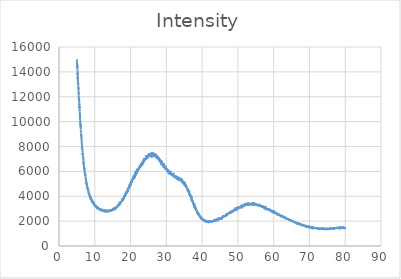
| Category | Intensity |
|---|---|
| 5.0 | 15005 |
| 5.02 | 14952 |
| 5.04 | 14813 |
| 5.06 | 14554 |
| 5.08 | 14655 |
| 5.1 | 14318 |
| 5.12 | 14511 |
| 5.14 | 14189 |
| 5.16 | 14119 |
| 5.18 | 13913 |
| 5.2 | 13795 |
| 5.22 | 13940 |
| 5.24 | 13395 |
| 5.26 | 13611 |
| 5.28 | 13391 |
| 5.3 | 13389 |
| 5.32 | 13274 |
| 5.34 | 13050 |
| 5.36 | 13098 |
| 5.38 | 12923 |
| 5.4 | 12875 |
| 5.42 | 12619 |
| 5.44 | 12752 |
| 5.46 | 12563 |
| 5.48 | 12265 |
| 5.5 | 12319 |
| 5.52 | 12090 |
| 5.54 | 11977 |
| 5.56 | 11777 |
| 5.58 | 11646 |
| 5.6 | 11707 |
| 5.62 | 11916 |
| 5.64 | 11529 |
| 5.66 | 11331 |
| 5.68 | 11416 |
| 5.7 | 11079 |
| 5.72 | 11252 |
| 5.74 | 11083 |
| 5.76 | 10881 |
| 5.78 | 10916 |
| 5.8 | 10822 |
| 5.82 | 10483 |
| 5.84 | 10357 |
| 5.86 | 10312 |
| 5.88 | 10627 |
| 5.9 | 10221 |
| 5.92 | 9997 |
| 5.94 | 10034 |
| 5.96 | 9799 |
| 5.98 | 9768 |
| 6.0 | 9729 |
| 6.02 | 9867 |
| 6.04 | 9549 |
| 6.06 | 9697 |
| 6.08 | 9339 |
| 6.1 | 9264 |
| 6.12 | 9253 |
| 6.14 | 9113 |
| 6.16 | 9078 |
| 6.18 | 9033 |
| 6.2 | 8795 |
| 6.22 | 8984 |
| 6.24 | 8837 |
| 6.26 | 8747 |
| 6.28 | 8669 |
| 6.3 | 8688 |
| 6.32 | 8534 |
| 6.34 | 8543 |
| 6.36 | 8202 |
| 6.38 | 8177 |
| 6.4 | 8191 |
| 6.42 | 8208 |
| 6.44 | 8095 |
| 6.46 | 7788 |
| 6.48 | 7885 |
| 6.5 | 7824 |
| 6.52 | 7776 |
| 6.54 | 7689 |
| 6.56 | 7533 |
| 6.58 | 7528 |
| 6.6 | 7382 |
| 6.62 | 7327 |
| 6.64 | 7465 |
| 6.66 | 7439 |
| 6.68 | 7256 |
| 6.7 | 7175 |
| 6.72 | 7070 |
| 6.74 | 7187 |
| 6.76 | 7092 |
| 6.78 | 6926 |
| 6.8 | 6913 |
| 6.82 | 6947 |
| 6.84 | 6867 |
| 6.86 | 6611 |
| 6.88 | 6691 |
| 6.9 | 6750 |
| 6.92 | 6604 |
| 6.94 | 6467 |
| 6.96 | 6521 |
| 6.98 | 6542 |
| 7.0 | 6319 |
| 7.02 | 6363 |
| 7.04 | 6125 |
| 7.06 | 6295 |
| 7.08 | 6133 |
| 7.1 | 6136 |
| 7.12 | 6195 |
| 7.14 | 6014 |
| 7.16 | 5944 |
| 7.18 | 5918 |
| 7.2 | 5945 |
| 7.22 | 5826 |
| 7.24 | 5897 |
| 7.26 | 5782 |
| 7.28 | 5836 |
| 7.3 | 5774 |
| 7.32 | 5650 |
| 7.34 | 5632 |
| 7.36 | 5779 |
| 7.38 | 5620 |
| 7.4 | 5590 |
| 7.42 | 5469 |
| 7.44 | 5490 |
| 7.46 | 5500 |
| 7.48 | 5498 |
| 7.5 | 5333 |
| 7.52 | 5283 |
| 7.54 | 5147 |
| 7.56 | 5350 |
| 7.58 | 5272 |
| 7.6 | 5282 |
| 7.62 | 5114 |
| 7.64 | 5043 |
| 7.66 | 4933 |
| 7.68 | 4928 |
| 7.7 | 5122 |
| 7.72 | 4981 |
| 7.74 | 4982 |
| 7.76 | 4981 |
| 7.78 | 4934 |
| 7.8 | 4964 |
| 7.82 | 4791 |
| 7.84 | 4927 |
| 7.86 | 4872 |
| 7.88 | 4821 |
| 7.9 | 4759 |
| 7.92 | 4650 |
| 7.94 | 4760 |
| 7.96 | 4732 |
| 7.98 | 4593 |
| 8.0 | 4634 |
| 8.02 | 4582 |
| 8.04 | 4531 |
| 8.06 | 4525 |
| 8.08 | 4460 |
| 8.1 | 4495 |
| 8.12 | 4495 |
| 8.14 | 4513 |
| 8.16 | 4489 |
| 8.18 | 4535 |
| 8.2 | 4381 |
| 8.22 | 4392 |
| 8.24 | 4432 |
| 8.26 | 4380 |
| 8.28 | 4243 |
| 8.3 | 4258 |
| 8.32 | 4305 |
| 8.34 | 4216 |
| 8.36 | 4200 |
| 8.38 | 4253 |
| 8.4 | 4243 |
| 8.42 | 4191 |
| 8.44 | 4137 |
| 8.46 | 4210 |
| 8.48 | 4148 |
| 8.5 | 4126 |
| 8.52 | 4130 |
| 8.54 | 4037 |
| 8.56 | 4120 |
| 8.58 | 4029 |
| 8.6 | 4004 |
| 8.62 | 3953 |
| 8.64 | 4037 |
| 8.66 | 4099 |
| 8.68 | 3976 |
| 8.7 | 4007 |
| 8.72 | 4014 |
| 8.74 | 3887 |
| 8.76 | 4025 |
| 8.78 | 3826 |
| 8.8 | 3931 |
| 8.82 | 3880 |
| 8.84 | 3749 |
| 8.86 | 3846 |
| 8.88 | 3784 |
| 8.9 | 3830 |
| 8.92 | 3866 |
| 8.94 | 3850 |
| 8.96 | 3809 |
| 8.98 | 3771 |
| 9.0 | 3727 |
| 9.02 | 3683 |
| 9.04 | 3726 |
| 9.06 | 3797 |
| 9.08 | 3799 |
| 9.1 | 3633 |
| 9.12 | 3620 |
| 9.14 | 3677 |
| 9.16 | 3723 |
| 9.18 | 3618 |
| 9.2 | 3640 |
| 9.22 | 3666 |
| 9.24 | 3683 |
| 9.26 | 3644 |
| 9.28 | 3572 |
| 9.3 | 3563 |
| 9.32 | 3590 |
| 9.34 | 3567 |
| 9.36 | 3630 |
| 9.38 | 3478 |
| 9.4 | 3591 |
| 9.42 | 3467 |
| 9.44 | 3605 |
| 9.46 | 3463 |
| 9.48 | 3488 |
| 9.5 | 3526 |
| 9.52 | 3507 |
| 9.54 | 3500 |
| 9.56 | 3553 |
| 9.58 | 3525 |
| 9.6 | 3400 |
| 9.62 | 3564 |
| 9.64 | 3401 |
| 9.66 | 3449 |
| 9.68 | 3368 |
| 9.7 | 3330 |
| 9.72 | 3392 |
| 9.74 | 3439 |
| 9.76 | 3298 |
| 9.78 | 3265 |
| 9.8 | 3286 |
| 9.82 | 3393 |
| 9.84 | 3391 |
| 9.86 | 3398 |
| 9.88 | 3376 |
| 9.9 | 3294 |
| 9.92 | 3319 |
| 9.94 | 3351 |
| 9.96 | 3307 |
| 9.98 | 3268 |
| 10.0 | 3306 |
| 10.02 | 3192 |
| 10.04 | 3223 |
| 10.06 | 3244 |
| 10.08 | 3307 |
| 10.1 | 3338 |
| 10.12 | 3292 |
| 10.14 | 3194 |
| 10.16 | 3279 |
| 10.18 | 3222 |
| 10.2 | 3266 |
| 10.22 | 3200 |
| 10.24 | 3264 |
| 10.26 | 3226 |
| 10.28 | 3170 |
| 10.3 | 3203 |
| 10.32 | 3115 |
| 10.34 | 3235 |
| 10.36 | 3173 |
| 10.38 | 3147 |
| 10.4 | 3139 |
| 10.42 | 3178 |
| 10.44 | 3141 |
| 10.46 | 3110 |
| 10.48 | 3142 |
| 10.5 | 3221 |
| 10.52 | 3057 |
| 10.54 | 3177 |
| 10.56 | 3127 |
| 10.58 | 3022 |
| 10.6 | 3130 |
| 10.62 | 3108 |
| 10.64 | 3072 |
| 10.66 | 3059 |
| 10.68 | 2986 |
| 10.7 | 2994 |
| 10.72 | 3159 |
| 10.74 | 3131 |
| 10.76 | 2957 |
| 10.78 | 3005 |
| 10.8 | 3091 |
| 10.82 | 3064 |
| 10.84 | 3102 |
| 10.86 | 3030 |
| 10.88 | 3116 |
| 10.9 | 3106 |
| 10.92 | 3037 |
| 10.94 | 3160 |
| 10.96 | 3056 |
| 10.98 | 3007 |
| 11.0 | 3039 |
| 11.02 | 3040 |
| 11.04 | 3065 |
| 11.06 | 2977 |
| 11.08 | 3007 |
| 11.1 | 2989 |
| 11.12 | 2917 |
| 11.14 | 3049 |
| 11.16 | 2974 |
| 11.18 | 3051 |
| 11.2 | 2955 |
| 11.22 | 2919 |
| 11.24 | 2961 |
| 11.26 | 3002 |
| 11.28 | 3062 |
| 11.3 | 2922 |
| 11.32 | 2943 |
| 11.34 | 2987 |
| 11.36 | 2935 |
| 11.38 | 2959 |
| 11.4 | 2971 |
| 11.42 | 2927 |
| 11.44 | 2893 |
| 11.46 | 2992 |
| 11.48 | 2901 |
| 11.5 | 2879 |
| 11.52 | 2926 |
| 11.54 | 2922 |
| 11.56 | 2857 |
| 11.58 | 2886 |
| 11.6 | 2835 |
| 11.62 | 3018 |
| 11.64 | 2987 |
| 11.66 | 2900 |
| 11.68 | 2903 |
| 11.7 | 2888 |
| 11.72 | 2956 |
| 11.74 | 2911 |
| 11.76 | 2855 |
| 11.78 | 2921 |
| 11.8 | 2907 |
| 11.82 | 2855 |
| 11.84 | 2862 |
| 11.86 | 2912 |
| 11.88 | 2846 |
| 11.9 | 2895 |
| 11.92 | 2977 |
| 11.94 | 2912 |
| 11.96 | 2991 |
| 11.98 | 2940 |
| 12.0 | 2816 |
| 12.02 | 2938 |
| 12.04 | 2821 |
| 12.06 | 2945 |
| 12.08 | 2778 |
| 12.1 | 2840 |
| 12.12 | 2905 |
| 12.14 | 2867 |
| 12.16 | 2815 |
| 12.18 | 2943 |
| 12.2 | 2845 |
| 12.22 | 2806 |
| 12.24 | 2890 |
| 12.26 | 2907 |
| 12.28 | 2825 |
| 12.3 | 2848 |
| 12.32 | 2858 |
| 12.34 | 2838 |
| 12.36 | 2878 |
| 12.38 | 2892 |
| 12.4 | 2817 |
| 12.42 | 2776 |
| 12.44 | 2868 |
| 12.46 | 2879 |
| 12.48 | 2815 |
| 12.5 | 2807 |
| 12.52 | 2861 |
| 12.54 | 2752 |
| 12.56 | 2867 |
| 12.58 | 2871 |
| 12.6 | 2867 |
| 12.62 | 2816 |
| 12.64 | 2769 |
| 12.66 | 2845 |
| 12.68 | 2858 |
| 12.7 | 2851 |
| 12.72 | 2828 |
| 12.74 | 2774 |
| 12.76 | 2767 |
| 12.78 | 2787 |
| 12.8 | 2870 |
| 12.82 | 2817 |
| 12.84 | 2866 |
| 12.86 | 2821 |
| 12.88 | 2785 |
| 12.9 | 2797 |
| 12.92 | 2809 |
| 12.94 | 2932 |
| 12.96 | 2864 |
| 12.98 | 2782 |
| 13.0 | 2784 |
| 13.02 | 2863 |
| 13.04 | 2784 |
| 13.06 | 2772 |
| 13.08 | 2849 |
| 13.1 | 2822 |
| 13.12 | 2768 |
| 13.14 | 2790 |
| 13.16 | 2838 |
| 13.18 | 2828 |
| 13.2 | 2793 |
| 13.22 | 2846 |
| 13.24 | 2851 |
| 13.26 | 2842 |
| 13.28 | 2831 |
| 13.3 | 2761 |
| 13.32 | 2790 |
| 13.34 | 2732 |
| 13.36 | 2716 |
| 13.38 | 2836 |
| 13.4 | 2746 |
| 13.42 | 2758 |
| 13.44 | 2719 |
| 13.46 | 2776 |
| 13.48 | 2868 |
| 13.5 | 2776 |
| 13.52 | 2778 |
| 13.54 | 2772 |
| 13.56 | 2816 |
| 13.58 | 2697 |
| 13.6 | 2916 |
| 13.62 | 2804 |
| 13.64 | 2748 |
| 13.66 | 2789 |
| 13.68 | 2783 |
| 13.7 | 2729 |
| 13.72 | 2816 |
| 13.74 | 2787 |
| 13.76 | 2797 |
| 13.78 | 2765 |
| 13.8 | 2752 |
| 13.82 | 2824 |
| 13.84 | 2772 |
| 13.86 | 2836 |
| 13.88 | 2888 |
| 13.9 | 2817 |
| 13.92 | 2807 |
| 13.94 | 2730 |
| 13.96 | 2843 |
| 13.98 | 2842 |
| 14.0 | 2750 |
| 14.02 | 2908 |
| 14.04 | 2834 |
| 14.06 | 2922 |
| 14.08 | 2801 |
| 14.1 | 2849 |
| 14.12 | 2762 |
| 14.14 | 2745 |
| 14.16 | 2892 |
| 14.18 | 2851 |
| 14.2 | 2813 |
| 14.22 | 2810 |
| 14.24 | 2768 |
| 14.26 | 2867 |
| 14.28 | 2849 |
| 14.3 | 2823 |
| 14.32 | 2849 |
| 14.34 | 2752 |
| 14.36 | 2813 |
| 14.38 | 2830 |
| 14.4 | 2815 |
| 14.42 | 2770 |
| 14.44 | 2818 |
| 14.46 | 2910 |
| 14.48 | 2867 |
| 14.5 | 2916 |
| 14.52 | 2968 |
| 14.54 | 2917 |
| 14.56 | 2869 |
| 14.58 | 2874 |
| 14.6 | 2807 |
| 14.62 | 2911 |
| 14.64 | 2914 |
| 14.66 | 2821 |
| 14.68 | 2912 |
| 14.7 | 2899 |
| 14.72 | 2803 |
| 14.74 | 2867 |
| 14.76 | 2921 |
| 14.78 | 2846 |
| 14.8 | 2836 |
| 14.82 | 2894 |
| 14.84 | 2910 |
| 14.86 | 2848 |
| 14.88 | 2887 |
| 14.9 | 2853 |
| 14.92 | 2815 |
| 14.94 | 2930 |
| 14.96 | 2981 |
| 14.98 | 2900 |
| 15.0 | 2943 |
| 15.02 | 2915 |
| 15.04 | 2955 |
| 15.06 | 2919 |
| 15.08 | 2926 |
| 15.1 | 2953 |
| 15.12 | 2948 |
| 15.14 | 3020 |
| 15.16 | 3043 |
| 15.18 | 2917 |
| 15.2 | 2954 |
| 15.22 | 3054 |
| 15.24 | 2989 |
| 15.26 | 2951 |
| 15.28 | 3027 |
| 15.3 | 3094 |
| 15.32 | 2910 |
| 15.34 | 2960 |
| 15.36 | 3005 |
| 15.38 | 3007 |
| 15.4 | 2940 |
| 15.42 | 3015 |
| 15.44 | 3015 |
| 15.46 | 2924 |
| 15.48 | 2950 |
| 15.5 | 3022 |
| 15.52 | 2946 |
| 15.54 | 2864 |
| 15.56 | 2984 |
| 15.58 | 3057 |
| 15.6 | 3014 |
| 15.62 | 3038 |
| 15.64 | 3068 |
| 15.66 | 3077 |
| 15.68 | 2994 |
| 15.7 | 2995 |
| 15.72 | 2962 |
| 15.74 | 3041 |
| 15.76 | 3113 |
| 15.78 | 3017 |
| 15.8 | 3031 |
| 15.82 | 3005 |
| 15.84 | 3026 |
| 15.86 | 3160 |
| 15.88 | 3003 |
| 15.9 | 3083 |
| 15.92 | 3067 |
| 15.94 | 3116 |
| 15.96 | 3104 |
| 15.98 | 3146 |
| 16.0 | 3109 |
| 16.02 | 3091 |
| 16.04 | 3057 |
| 16.06 | 3067 |
| 16.08 | 3182 |
| 16.1 | 3120 |
| 16.12 | 3109 |
| 16.14 | 3154 |
| 16.16 | 3131 |
| 16.18 | 3150 |
| 16.2 | 3121 |
| 16.22 | 3143 |
| 16.24 | 3159 |
| 16.26 | 3160 |
| 16.28 | 3180 |
| 16.3 | 3132 |
| 16.32 | 3155 |
| 16.34 | 3178 |
| 16.36 | 3244 |
| 16.38 | 3220 |
| 16.4 | 3150 |
| 16.42 | 3179 |
| 16.44 | 3210 |
| 16.46 | 3238 |
| 16.48 | 3256 |
| 16.5 | 3236 |
| 16.52 | 3171 |
| 16.54 | 3243 |
| 16.56 | 3315 |
| 16.58 | 3249 |
| 16.6 | 3255 |
| 16.62 | 3254 |
| 16.64 | 3338 |
| 16.66 | 3319 |
| 16.68 | 3254 |
| 16.7 | 3394 |
| 16.72 | 3266 |
| 16.74 | 3340 |
| 16.76 | 3312 |
| 16.78 | 3406 |
| 16.8 | 3376 |
| 16.82 | 3330 |
| 16.84 | 3351 |
| 16.86 | 3337 |
| 16.88 | 3343 |
| 16.9 | 3323 |
| 16.92 | 3362 |
| 16.94 | 3289 |
| 16.96 | 3565 |
| 16.98 | 3407 |
| 17.0 | 3434 |
| 17.02 | 3402 |
| 17.04 | 3366 |
| 17.06 | 3391 |
| 17.08 | 3425 |
| 17.1 | 3408 |
| 17.12 | 3418 |
| 17.14 | 3461 |
| 17.16 | 3503 |
| 17.18 | 3462 |
| 17.2 | 3484 |
| 17.22 | 3569 |
| 17.24 | 3447 |
| 17.26 | 3483 |
| 17.28 | 3587 |
| 17.3 | 3502 |
| 17.32 | 3537 |
| 17.34 | 3505 |
| 17.36 | 3495 |
| 17.38 | 3557 |
| 17.4 | 3574 |
| 17.42 | 3615 |
| 17.44 | 3570 |
| 17.46 | 3572 |
| 17.48 | 3542 |
| 17.5 | 3602 |
| 17.52 | 3545 |
| 17.54 | 3600 |
| 17.56 | 3582 |
| 17.58 | 3670 |
| 17.6 | 3680 |
| 17.62 | 3659 |
| 17.64 | 3639 |
| 17.66 | 3827 |
| 17.68 | 3702 |
| 17.7 | 3720 |
| 17.72 | 3648 |
| 17.74 | 3780 |
| 17.76 | 3691 |
| 17.78 | 3753 |
| 17.8 | 3710 |
| 17.82 | 3733 |
| 17.84 | 3835 |
| 17.86 | 3743 |
| 17.88 | 3662 |
| 17.9 | 3785 |
| 17.92 | 3717 |
| 17.94 | 3824 |
| 17.96 | 3825 |
| 17.98 | 3789 |
| 18.0 | 3765 |
| 18.02 | 3876 |
| 18.04 | 3736 |
| 18.06 | 3883 |
| 18.08 | 3857 |
| 18.1 | 3890 |
| 18.12 | 3829 |
| 18.14 | 3802 |
| 18.16 | 3865 |
| 18.18 | 3909 |
| 18.2 | 3961 |
| 18.22 | 3868 |
| 18.24 | 3921 |
| 18.26 | 3982 |
| 18.28 | 4046 |
| 18.3 | 4091 |
| 18.32 | 3956 |
| 18.34 | 4059 |
| 18.36 | 3963 |
| 18.38 | 3973 |
| 18.4 | 4097 |
| 18.42 | 4015 |
| 18.44 | 4057 |
| 18.46 | 4036 |
| 18.48 | 4068 |
| 18.5 | 4126 |
| 18.52 | 4054 |
| 18.54 | 4105 |
| 18.56 | 4232 |
| 18.58 | 4150 |
| 18.6 | 4146 |
| 18.62 | 4130 |
| 18.64 | 4216 |
| 18.66 | 4259 |
| 18.68 | 4117 |
| 18.7 | 4236 |
| 18.72 | 4231 |
| 18.74 | 4110 |
| 18.76 | 4334 |
| 18.78 | 4324 |
| 18.8 | 4317 |
| 18.82 | 4354 |
| 18.84 | 4188 |
| 18.86 | 4174 |
| 18.88 | 4391 |
| 18.9 | 4276 |
| 18.92 | 4268 |
| 18.94 | 4402 |
| 18.96 | 4407 |
| 18.98 | 4353 |
| 19.0 | 4410 |
| 19.02 | 4399 |
| 19.04 | 4365 |
| 19.06 | 4400 |
| 19.08 | 4404 |
| 19.1 | 4284 |
| 19.12 | 4403 |
| 19.14 | 4501 |
| 19.16 | 4455 |
| 19.18 | 4594 |
| 19.2 | 4591 |
| 19.22 | 4560 |
| 19.24 | 4561 |
| 19.26 | 4538 |
| 19.28 | 4369 |
| 19.3 | 4547 |
| 19.32 | 4515 |
| 19.34 | 4529 |
| 19.36 | 4535 |
| 19.38 | 4680 |
| 19.4 | 4584 |
| 19.42 | 4653 |
| 19.44 | 4620 |
| 19.46 | 4650 |
| 19.48 | 4736 |
| 19.5 | 4571 |
| 19.52 | 4727 |
| 19.54 | 4714 |
| 19.56 | 4684 |
| 19.58 | 4810 |
| 19.6 | 4812 |
| 19.62 | 4651 |
| 19.64 | 4718 |
| 19.66 | 4918 |
| 19.68 | 4760 |
| 19.7 | 4837 |
| 19.72 | 4784 |
| 19.74 | 4725 |
| 19.76 | 4769 |
| 19.78 | 4850 |
| 19.8 | 4881 |
| 19.82 | 4829 |
| 19.84 | 5004 |
| 19.86 | 4866 |
| 19.88 | 4870 |
| 19.9 | 4861 |
| 19.92 | 4986 |
| 19.94 | 5014 |
| 19.96 | 5042 |
| 19.98 | 5009 |
| 20.0 | 5028 |
| 20.02 | 4859 |
| 20.04 | 5040 |
| 20.06 | 4958 |
| 20.08 | 5093 |
| 20.1 | 5034 |
| 20.12 | 5141 |
| 20.14 | 5063 |
| 20.16 | 5165 |
| 20.18 | 5073 |
| 20.2 | 5105 |
| 20.22 | 5114 |
| 20.24 | 5227 |
| 20.26 | 5201 |
| 20.28 | 5203 |
| 20.3 | 5225 |
| 20.32 | 5080 |
| 20.34 | 5138 |
| 20.36 | 5273 |
| 20.38 | 5204 |
| 20.4 | 5328 |
| 20.42 | 5095 |
| 20.44 | 5388 |
| 20.46 | 5264 |
| 20.48 | 5270 |
| 20.5 | 5297 |
| 20.52 | 5349 |
| 20.54 | 5344 |
| 20.56 | 5380 |
| 20.58 | 5318 |
| 20.6 | 5303 |
| 20.62 | 5399 |
| 20.64 | 5358 |
| 20.66 | 5463 |
| 20.68 | 5371 |
| 20.7 | 5502 |
| 20.72 | 5407 |
| 20.74 | 5326 |
| 20.76 | 5385 |
| 20.78 | 5510 |
| 20.8 | 5454 |
| 20.82 | 5583 |
| 20.84 | 5521 |
| 20.86 | 5574 |
| 20.88 | 5383 |
| 20.9 | 5456 |
| 20.92 | 5667 |
| 20.94 | 5563 |
| 20.96 | 5441 |
| 20.98 | 5507 |
| 21.0 | 5422 |
| 21.02 | 5623 |
| 21.04 | 5594 |
| 21.06 | 5691 |
| 21.08 | 5664 |
| 21.1 | 5678 |
| 21.12 | 5647 |
| 21.14 | 5718 |
| 21.16 | 5739 |
| 21.18 | 5673 |
| 21.2 | 5642 |
| 21.22 | 5508 |
| 21.24 | 5689 |
| 21.26 | 5758 |
| 21.28 | 5733 |
| 21.3 | 5709 |
| 21.32 | 5917 |
| 21.34 | 5806 |
| 21.36 | 5652 |
| 21.38 | 5986 |
| 21.4 | 5754 |
| 21.42 | 5786 |
| 21.44 | 5807 |
| 21.46 | 5824 |
| 21.48 | 5900 |
| 21.5 | 5841 |
| 21.52 | 5850 |
| 21.54 | 5980 |
| 21.56 | 5807 |
| 21.58 | 5852 |
| 21.6 | 5808 |
| 21.62 | 5951 |
| 21.64 | 5893 |
| 21.66 | 5802 |
| 21.68 | 6134 |
| 21.7 | 6062 |
| 21.72 | 5893 |
| 21.74 | 5910 |
| 21.76 | 5901 |
| 21.78 | 6030 |
| 21.8 | 5960 |
| 21.82 | 6142 |
| 21.84 | 5954 |
| 21.86 | 6038 |
| 21.88 | 6026 |
| 21.9 | 6113 |
| 21.92 | 6020 |
| 21.94 | 6157 |
| 21.96 | 6095 |
| 21.98 | 6197 |
| 22.0 | 6244 |
| 22.02 | 5990 |
| 22.04 | 6092 |
| 22.06 | 5999 |
| 22.08 | 6110 |
| 22.1 | 6094 |
| 22.12 | 6068 |
| 22.14 | 6112 |
| 22.16 | 6214 |
| 22.18 | 6154 |
| 22.2 | 6154 |
| 22.22 | 6247 |
| 22.24 | 6281 |
| 22.26 | 6130 |
| 22.28 | 6235 |
| 22.3 | 6207 |
| 22.32 | 6238 |
| 22.34 | 6278 |
| 22.36 | 6297 |
| 22.38 | 6319 |
| 22.4 | 6231 |
| 22.42 | 6294 |
| 22.44 | 6256 |
| 22.46 | 6263 |
| 22.48 | 6357 |
| 22.5 | 6339 |
| 22.52 | 6360 |
| 22.54 | 6350 |
| 22.56 | 6387 |
| 22.58 | 6486 |
| 22.6 | 6351 |
| 22.62 | 6482 |
| 22.64 | 6263 |
| 22.66 | 6464 |
| 22.68 | 6433 |
| 22.7 | 6427 |
| 22.72 | 6507 |
| 22.74 | 6379 |
| 22.76 | 6508 |
| 22.78 | 6441 |
| 22.8 | 6500 |
| 22.82 | 6401 |
| 22.84 | 6543 |
| 22.86 | 6413 |
| 22.88 | 6536 |
| 22.9 | 6342 |
| 22.92 | 6589 |
| 22.94 | 6608 |
| 22.96 | 6540 |
| 22.98 | 6595 |
| 23.0 | 6485 |
| 23.02 | 6489 |
| 23.04 | 6441 |
| 23.06 | 6654 |
| 23.08 | 6565 |
| 23.1 | 6613 |
| 23.12 | 6568 |
| 23.14 | 6682 |
| 23.16 | 6563 |
| 23.18 | 6486 |
| 23.2 | 6677 |
| 23.22 | 6690 |
| 23.24 | 6499 |
| 23.26 | 6690 |
| 23.28 | 6723 |
| 23.3 | 6506 |
| 23.32 | 6682 |
| 23.34 | 6766 |
| 23.36 | 6673 |
| 23.38 | 6766 |
| 23.4 | 6831 |
| 23.42 | 6756 |
| 23.44 | 6709 |
| 23.46 | 6706 |
| 23.48 | 6763 |
| 23.5 | 6758 |
| 23.52 | 6785 |
| 23.54 | 6819 |
| 23.56 | 6624 |
| 23.58 | 6942 |
| 23.6 | 6861 |
| 23.62 | 6795 |
| 23.64 | 6750 |
| 23.66 | 6877 |
| 23.68 | 6872 |
| 23.7 | 6912 |
| 23.72 | 6844 |
| 23.74 | 6926 |
| 23.76 | 7009 |
| 23.78 | 6775 |
| 23.8 | 6890 |
| 23.82 | 6851 |
| 23.84 | 7034 |
| 23.86 | 6864 |
| 23.88 | 7078 |
| 23.9 | 6918 |
| 23.92 | 6918 |
| 23.94 | 6960 |
| 23.96 | 6942 |
| 23.98 | 6929 |
| 24.0 | 7002 |
| 24.02 | 7040 |
| 24.04 | 6885 |
| 24.06 | 6918 |
| 24.08 | 6937 |
| 24.1 | 7045 |
| 24.12 | 6932 |
| 24.14 | 6895 |
| 24.16 | 7074 |
| 24.18 | 7027 |
| 24.2 | 7015 |
| 24.22 | 7028 |
| 24.24 | 7089 |
| 24.26 | 7068 |
| 24.28 | 7012 |
| 24.3 | 7134 |
| 24.32 | 7060 |
| 24.34 | 6939 |
| 24.36 | 7065 |
| 24.38 | 7082 |
| 24.4 | 7186 |
| 24.42 | 7162 |
| 24.44 | 7059 |
| 24.46 | 7105 |
| 24.48 | 7316 |
| 24.5 | 7074 |
| 24.52 | 7128 |
| 24.54 | 7261 |
| 24.56 | 7176 |
| 24.58 | 7071 |
| 24.6 | 7016 |
| 24.62 | 7029 |
| 24.64 | 7227 |
| 24.66 | 7060 |
| 24.68 | 7290 |
| 24.7 | 7307 |
| 24.72 | 7030 |
| 24.74 | 7113 |
| 24.76 | 7221 |
| 24.78 | 7136 |
| 24.8 | 7292 |
| 24.82 | 7326 |
| 24.84 | 7194 |
| 24.86 | 7248 |
| 24.88 | 7245 |
| 24.9 | 7195 |
| 24.92 | 7303 |
| 24.94 | 7240 |
| 24.96 | 7233 |
| 24.98 | 7197 |
| 25.0 | 7186 |
| 25.02 | 7185 |
| 25.04 | 7271 |
| 25.06 | 7376 |
| 25.08 | 7368 |
| 25.1 | 7255 |
| 25.12 | 7291 |
| 25.14 | 7427 |
| 25.16 | 7313 |
| 25.18 | 7358 |
| 25.2 | 7453 |
| 25.22 | 7329 |
| 25.24 | 7409 |
| 25.26 | 7296 |
| 25.28 | 7391 |
| 25.3 | 7219 |
| 25.32 | 7234 |
| 25.34 | 7159 |
| 25.36 | 7343 |
| 25.38 | 7455 |
| 25.4 | 7441 |
| 25.42 | 7315 |
| 25.44 | 7377 |
| 25.46 | 7343 |
| 25.48 | 7297 |
| 25.5 | 7446 |
| 25.52 | 7371 |
| 25.54 | 7405 |
| 25.56 | 7328 |
| 25.58 | 7387 |
| 25.6 | 7400 |
| 25.62 | 7321 |
| 25.64 | 7340 |
| 25.66 | 7349 |
| 25.68 | 7224 |
| 25.7 | 7418 |
| 25.72 | 7477 |
| 25.74 | 7271 |
| 25.76 | 7240 |
| 25.78 | 7350 |
| 25.8 | 7260 |
| 25.82 | 7327 |
| 25.84 | 7112 |
| 25.86 | 7410 |
| 25.88 | 7264 |
| 25.9 | 7555 |
| 25.92 | 7493 |
| 25.94 | 7292 |
| 25.96 | 7347 |
| 25.98 | 7414 |
| 26.0 | 7313 |
| 26.02 | 7350 |
| 26.04 | 7397 |
| 26.06 | 7360 |
| 26.08 | 7250 |
| 26.1 | 7179 |
| 26.12 | 7370 |
| 26.14 | 7415 |
| 26.16 | 7128 |
| 26.18 | 7327 |
| 26.2 | 7357 |
| 26.22 | 7328 |
| 26.24 | 7447 |
| 26.26 | 7485 |
| 26.28 | 7281 |
| 26.3 | 7509 |
| 26.32 | 7207 |
| 26.34 | 7290 |
| 26.36 | 7404 |
| 26.38 | 7363 |
| 26.4 | 7253 |
| 26.42 | 7335 |
| 26.44 | 7267 |
| 26.46 | 7349 |
| 26.48 | 7299 |
| 26.5 | 7456 |
| 26.52 | 7464 |
| 26.54 | 7344 |
| 26.56 | 7426 |
| 26.58 | 7409 |
| 26.6 | 7218 |
| 26.62 | 7388 |
| 26.64 | 7261 |
| 26.66 | 7411 |
| 26.68 | 7303 |
| 26.7 | 7307 |
| 26.72 | 7397 |
| 26.74 | 7306 |
| 26.76 | 7181 |
| 26.78 | 7332 |
| 26.8 | 7281 |
| 26.82 | 7315 |
| 26.84 | 7298 |
| 26.86 | 7282 |
| 26.88 | 7156 |
| 26.9 | 7258 |
| 26.92 | 7315 |
| 26.94 | 7203 |
| 26.96 | 7245 |
| 26.98 | 7198 |
| 27.0 | 7417 |
| 27.02 | 7266 |
| 27.04 | 7347 |
| 27.06 | 7248 |
| 27.08 | 7274 |
| 27.1 | 7352 |
| 27.12 | 7155 |
| 27.14 | 7281 |
| 27.16 | 7181 |
| 27.18 | 7198 |
| 27.2 | 7076 |
| 27.22 | 7243 |
| 27.24 | 7099 |
| 27.26 | 7055 |
| 27.28 | 7100 |
| 27.3 | 7306 |
| 27.32 | 7236 |
| 27.34 | 7117 |
| 27.36 | 7287 |
| 27.38 | 7029 |
| 27.4 | 7032 |
| 27.42 | 7138 |
| 27.44 | 7142 |
| 27.46 | 7122 |
| 27.48 | 7031 |
| 27.5 | 7096 |
| 27.52 | 7117 |
| 27.54 | 7129 |
| 27.56 | 7094 |
| 27.58 | 7194 |
| 27.6 | 7177 |
| 27.62 | 7111 |
| 27.64 | 7078 |
| 27.66 | 7159 |
| 27.68 | 7042 |
| 27.7 | 7021 |
| 27.72 | 7116 |
| 27.74 | 6971 |
| 27.76 | 6984 |
| 27.78 | 7114 |
| 27.8 | 6961 |
| 27.82 | 7093 |
| 27.84 | 6979 |
| 27.86 | 7133 |
| 27.88 | 7017 |
| 27.9 | 6883 |
| 27.92 | 6980 |
| 27.94 | 6976 |
| 27.96 | 6882 |
| 27.98 | 6889 |
| 28.0 | 6919 |
| 28.02 | 6993 |
| 28.04 | 6837 |
| 28.06 | 6907 |
| 28.08 | 6934 |
| 28.1 | 6891 |
| 28.12 | 6892 |
| 28.14 | 7026 |
| 28.16 | 6841 |
| 28.18 | 6879 |
| 28.2 | 6946 |
| 28.22 | 6830 |
| 28.24 | 6863 |
| 28.26 | 6848 |
| 28.28 | 6835 |
| 28.3 | 6722 |
| 28.32 | 6801 |
| 28.34 | 6822 |
| 28.36 | 6738 |
| 28.38 | 6816 |
| 28.4 | 6710 |
| 28.42 | 6749 |
| 28.44 | 6821 |
| 28.46 | 6738 |
| 28.48 | 6727 |
| 28.5 | 6771 |
| 28.52 | 6648 |
| 28.54 | 6891 |
| 28.56 | 6888 |
| 28.58 | 6644 |
| 28.6 | 6713 |
| 28.62 | 6831 |
| 28.64 | 6501 |
| 28.66 | 6724 |
| 28.68 | 6774 |
| 28.7 | 6643 |
| 28.72 | 6706 |
| 28.74 | 6808 |
| 28.76 | 6573 |
| 28.78 | 6559 |
| 28.8 | 6736 |
| 28.82 | 6659 |
| 28.84 | 6640 |
| 28.86 | 6605 |
| 28.88 | 6666 |
| 28.9 | 6512 |
| 28.92 | 6529 |
| 28.94 | 6523 |
| 28.96 | 6613 |
| 28.98 | 6470 |
| 29.0 | 6554 |
| 29.02 | 6498 |
| 29.04 | 6438 |
| 29.06 | 6494 |
| 29.08 | 6661 |
| 29.1 | 6524 |
| 29.12 | 6447 |
| 29.14 | 6432 |
| 29.16 | 6394 |
| 29.18 | 6310 |
| 29.2 | 6577 |
| 29.22 | 6597 |
| 29.24 | 6544 |
| 29.26 | 6395 |
| 29.28 | 6447 |
| 29.3 | 6381 |
| 29.32 | 6635 |
| 29.34 | 6505 |
| 29.36 | 6527 |
| 29.38 | 6359 |
| 29.4 | 6430 |
| 29.42 | 6519 |
| 29.44 | 6383 |
| 29.46 | 6448 |
| 29.48 | 6422 |
| 29.5 | 6410 |
| 29.52 | 6393 |
| 29.54 | 6287 |
| 29.56 | 6364 |
| 29.58 | 6274 |
| 29.6 | 6401 |
| 29.62 | 6332 |
| 29.64 | 6224 |
| 29.66 | 6255 |
| 29.68 | 6390 |
| 29.7 | 6206 |
| 29.72 | 6336 |
| 29.74 | 6317 |
| 29.76 | 6138 |
| 29.78 | 6277 |
| 29.8 | 6241 |
| 29.82 | 6388 |
| 29.84 | 6236 |
| 29.86 | 6167 |
| 29.88 | 6259 |
| 29.9 | 6319 |
| 29.92 | 6235 |
| 29.94 | 6228 |
| 29.96 | 6218 |
| 29.98 | 6266 |
| 30.0 | 6175 |
| 30.02 | 6159 |
| 30.04 | 6145 |
| 30.06 | 6151 |
| 30.08 | 6207 |
| 30.1 | 6219 |
| 30.12 | 6126 |
| 30.14 | 6222 |
| 30.16 | 6152 |
| 30.18 | 6142 |
| 30.2 | 6040 |
| 30.22 | 6159 |
| 30.24 | 6012 |
| 30.26 | 6041 |
| 30.28 | 6126 |
| 30.3 | 6088 |
| 30.32 | 6193 |
| 30.34 | 6047 |
| 30.36 | 5942 |
| 30.38 | 6093 |
| 30.4 | 5934 |
| 30.42 | 6122 |
| 30.44 | 6073 |
| 30.46 | 6011 |
| 30.48 | 5960 |
| 30.5 | 6053 |
| 30.52 | 6043 |
| 30.54 | 5940 |
| 30.56 | 6017 |
| 30.58 | 6040 |
| 30.6 | 5982 |
| 30.62 | 6109 |
| 30.64 | 6058 |
| 30.66 | 6046 |
| 30.68 | 6066 |
| 30.7 | 5790 |
| 30.72 | 6033 |
| 30.74 | 5881 |
| 30.76 | 5972 |
| 30.78 | 5894 |
| 30.8 | 5929 |
| 30.82 | 5951 |
| 30.84 | 5995 |
| 30.86 | 5967 |
| 30.88 | 5747 |
| 30.9 | 5944 |
| 30.92 | 5879 |
| 30.94 | 5875 |
| 30.96 | 5844 |
| 30.98 | 5993 |
| 31.0 | 5865 |
| 31.02 | 5956 |
| 31.04 | 6049 |
| 31.06 | 5800 |
| 31.08 | 5945 |
| 31.1 | 5889 |
| 31.12 | 5885 |
| 31.14 | 5729 |
| 31.16 | 5910 |
| 31.18 | 5761 |
| 31.2 | 5865 |
| 31.22 | 5893 |
| 31.24 | 5726 |
| 31.26 | 6002 |
| 31.28 | 5900 |
| 31.3 | 5771 |
| 31.32 | 5740 |
| 31.34 | 5848 |
| 31.36 | 5824 |
| 31.38 | 5718 |
| 31.4 | 5744 |
| 31.42 | 5722 |
| 31.44 | 5724 |
| 31.46 | 5788 |
| 31.48 | 5747 |
| 31.5 | 5729 |
| 31.52 | 5873 |
| 31.54 | 5792 |
| 31.56 | 5678 |
| 31.58 | 5762 |
| 31.6 | 5727 |
| 31.62 | 5761 |
| 31.64 | 5704 |
| 31.66 | 5686 |
| 31.68 | 5614 |
| 31.7 | 5681 |
| 31.72 | 5783 |
| 31.74 | 5696 |
| 31.76 | 5639 |
| 31.78 | 5705 |
| 31.8 | 5726 |
| 31.82 | 5697 |
| 31.84 | 5701 |
| 31.86 | 5731 |
| 31.88 | 5766 |
| 31.9 | 5687 |
| 31.92 | 5650 |
| 31.94 | 5704 |
| 31.96 | 5671 |
| 31.98 | 5880 |
| 32.0 | 5785 |
| 32.02 | 5774 |
| 32.04 | 5656 |
| 32.06 | 5598 |
| 32.08 | 5682 |
| 32.1 | 5594 |
| 32.12 | 5569 |
| 32.14 | 5576 |
| 32.16 | 5660 |
| 32.18 | 5547 |
| 32.2 | 5716 |
| 32.22 | 5516 |
| 32.24 | 5568 |
| 32.26 | 5495 |
| 32.28 | 5556 |
| 32.3 | 5617 |
| 32.32 | 5607 |
| 32.34 | 5624 |
| 32.36 | 5584 |
| 32.38 | 5694 |
| 32.4 | 5529 |
| 32.42 | 5586 |
| 32.44 | 5554 |
| 32.46 | 5469 |
| 32.48 | 5572 |
| 32.5 | 5597 |
| 32.52 | 5478 |
| 32.54 | 5675 |
| 32.56 | 5600 |
| 32.58 | 5576 |
| 32.6 | 5545 |
| 32.62 | 5562 |
| 32.64 | 5570 |
| 32.66 | 5514 |
| 32.68 | 5603 |
| 32.7 | 5484 |
| 32.72 | 5639 |
| 32.74 | 5630 |
| 32.76 | 5499 |
| 32.78 | 5418 |
| 32.8 | 5620 |
| 32.82 | 5455 |
| 32.84 | 5548 |
| 32.86 | 5528 |
| 32.88 | 5585 |
| 32.9 | 5521 |
| 32.92 | 5353 |
| 32.94 | 5455 |
| 32.96 | 5455 |
| 32.98 | 5507 |
| 33.0 | 5451 |
| 33.02 | 5411 |
| 33.04 | 5485 |
| 33.06 | 5515 |
| 33.08 | 5563 |
| 33.1 | 5406 |
| 33.12 | 5484 |
| 33.14 | 5421 |
| 33.16 | 5576 |
| 33.18 | 5410 |
| 33.2 | 5498 |
| 33.22 | 5579 |
| 33.24 | 5472 |
| 33.26 | 5404 |
| 33.28 | 5431 |
| 33.3 | 5462 |
| 33.32 | 5413 |
| 33.34 | 5450 |
| 33.36 | 5421 |
| 33.38 | 5285 |
| 33.4 | 5402 |
| 33.42 | 5322 |
| 33.44 | 5456 |
| 33.46 | 5425 |
| 33.48 | 5406 |
| 33.5 | 5256 |
| 33.52 | 5481 |
| 33.54 | 5321 |
| 33.56 | 5411 |
| 33.58 | 5434 |
| 33.6 | 5462 |
| 33.62 | 5525 |
| 33.64 | 5276 |
| 33.66 | 5312 |
| 33.68 | 5238 |
| 33.7 | 5361 |
| 33.72 | 5339 |
| 33.74 | 5427 |
| 33.76 | 5439 |
| 33.78 | 5372 |
| 33.8 | 5402 |
| 33.82 | 5300 |
| 33.84 | 5367 |
| 33.86 | 5454 |
| 33.88 | 5256 |
| 33.9 | 5358 |
| 33.92 | 5344 |
| 33.94 | 5333 |
| 33.96 | 5315 |
| 33.98 | 5292 |
| 34.0 | 5415 |
| 34.02 | 5290 |
| 34.04 | 5334 |
| 34.06 | 5379 |
| 34.08 | 5221 |
| 34.1 | 5312 |
| 34.12 | 5195 |
| 34.14 | 5421 |
| 34.16 | 5268 |
| 34.18 | 5265 |
| 34.2 | 5339 |
| 34.22 | 5229 |
| 34.24 | 5374 |
| 34.26 | 5247 |
| 34.28 | 5406 |
| 34.3 | 5260 |
| 34.32 | 5305 |
| 34.34 | 5298 |
| 34.36 | 5288 |
| 34.38 | 5101 |
| 34.4 | 5167 |
| 34.42 | 5194 |
| 34.44 | 5259 |
| 34.46 | 5240 |
| 34.48 | 5307 |
| 34.5 | 5155 |
| 34.52 | 5226 |
| 34.54 | 5183 |
| 34.56 | 5128 |
| 34.58 | 5142 |
| 34.6 | 5048 |
| 34.62 | 5000 |
| 34.64 | 5028 |
| 34.66 | 5068 |
| 34.68 | 5164 |
| 34.7 | 5162 |
| 34.72 | 5048 |
| 34.74 | 5091 |
| 34.76 | 5187 |
| 34.78 | 5142 |
| 34.8 | 5075 |
| 34.82 | 5230 |
| 34.84 | 5153 |
| 34.86 | 4982 |
| 34.88 | 4974 |
| 34.9 | 5123 |
| 34.92 | 5077 |
| 34.94 | 5142 |
| 34.96 | 4942 |
| 34.98 | 4991 |
| 35.0 | 4977 |
| 35.02 | 5000 |
| 35.04 | 5029 |
| 35.06 | 5030 |
| 35.08 | 4853 |
| 35.1 | 5044 |
| 35.12 | 4970 |
| 35.14 | 4907 |
| 35.16 | 4920 |
| 35.18 | 5119 |
| 35.2 | 5034 |
| 35.22 | 5007 |
| 35.24 | 4949 |
| 35.26 | 4839 |
| 35.28 | 4803 |
| 35.3 | 4840 |
| 35.32 | 4869 |
| 35.34 | 4867 |
| 35.36 | 4830 |
| 35.38 | 4775 |
| 35.4 | 4952 |
| 35.42 | 4832 |
| 35.44 | 4849 |
| 35.46 | 4860 |
| 35.48 | 4809 |
| 35.5 | 4800 |
| 35.52 | 4842 |
| 35.54 | 4715 |
| 35.56 | 4792 |
| 35.58 | 4838 |
| 35.6 | 4658 |
| 35.62 | 4677 |
| 35.64 | 4702 |
| 35.66 | 4697 |
| 35.68 | 4696 |
| 35.7 | 4732 |
| 35.72 | 4705 |
| 35.74 | 4701 |
| 35.76 | 4689 |
| 35.78 | 4656 |
| 35.8 | 4663 |
| 35.82 | 4599 |
| 35.84 | 4633 |
| 35.86 | 4485 |
| 35.88 | 4562 |
| 35.9 | 4467 |
| 35.92 | 4569 |
| 35.94 | 4572 |
| 35.96 | 4630 |
| 35.98 | 4594 |
| 36.0 | 4630 |
| 36.02 | 4517 |
| 36.04 | 4550 |
| 36.06 | 4484 |
| 36.08 | 4563 |
| 36.1 | 4491 |
| 36.12 | 4456 |
| 36.14 | 4477 |
| 36.16 | 4384 |
| 36.18 | 4502 |
| 36.2 | 4331 |
| 36.22 | 4493 |
| 36.24 | 4306 |
| 36.26 | 4292 |
| 36.28 | 4367 |
| 36.3 | 4379 |
| 36.32 | 4382 |
| 36.34 | 4377 |
| 36.36 | 4230 |
| 36.38 | 4396 |
| 36.4 | 4388 |
| 36.42 | 4134 |
| 36.44 | 4118 |
| 36.46 | 4180 |
| 36.48 | 4089 |
| 36.5 | 4251 |
| 36.52 | 4111 |
| 36.54 | 4181 |
| 36.56 | 4095 |
| 36.58 | 4176 |
| 36.6 | 3953 |
| 36.62 | 4035 |
| 36.64 | 4082 |
| 36.66 | 4180 |
| 36.68 | 4010 |
| 36.7 | 4113 |
| 36.72 | 4086 |
| 36.74 | 4088 |
| 36.76 | 3991 |
| 36.78 | 3997 |
| 36.8 | 4074 |
| 36.82 | 3949 |
| 36.84 | 4086 |
| 36.86 | 3920 |
| 36.88 | 3945 |
| 36.9 | 3814 |
| 36.92 | 3841 |
| 36.94 | 3860 |
| 36.96 | 3891 |
| 36.98 | 3871 |
| 37.0 | 3790 |
| 37.02 | 4030 |
| 37.04 | 3864 |
| 37.06 | 3670 |
| 37.08 | 3834 |
| 37.1 | 3675 |
| 37.12 | 3711 |
| 37.14 | 3689 |
| 37.16 | 3766 |
| 37.18 | 3633 |
| 37.2 | 3610 |
| 37.22 | 3594 |
| 37.24 | 3698 |
| 37.26 | 3658 |
| 37.28 | 3616 |
| 37.3 | 3655 |
| 37.32 | 3605 |
| 37.34 | 3580 |
| 37.36 | 3629 |
| 37.38 | 3594 |
| 37.4 | 3480 |
| 37.42 | 3572 |
| 37.44 | 3603 |
| 37.46 | 3512 |
| 37.48 | 3534 |
| 37.5 | 3456 |
| 37.52 | 3406 |
| 37.54 | 3478 |
| 37.56 | 3452 |
| 37.58 | 3323 |
| 37.6 | 3299 |
| 37.62 | 3351 |
| 37.64 | 3351 |
| 37.66 | 3389 |
| 37.68 | 3421 |
| 37.7 | 3247 |
| 37.72 | 3307 |
| 37.74 | 3333 |
| 37.76 | 3190 |
| 37.78 | 3091 |
| 37.8 | 3231 |
| 37.82 | 3237 |
| 37.84 | 3228 |
| 37.86 | 3395 |
| 37.88 | 3099 |
| 37.9 | 3155 |
| 37.92 | 3140 |
| 37.94 | 3134 |
| 37.96 | 3153 |
| 37.98 | 3212 |
| 38.0 | 3095 |
| 38.02 | 3085 |
| 38.04 | 3087 |
| 38.06 | 3078 |
| 38.08 | 3028 |
| 38.1 | 3098 |
| 38.12 | 2952 |
| 38.14 | 2988 |
| 38.16 | 3045 |
| 38.18 | 3043 |
| 38.2 | 3100 |
| 38.22 | 2952 |
| 38.24 | 2967 |
| 38.26 | 2920 |
| 38.28 | 3005 |
| 38.3 | 2927 |
| 38.32 | 2934 |
| 38.34 | 2876 |
| 38.36 | 2906 |
| 38.38 | 2882 |
| 38.4 | 2890 |
| 38.42 | 2796 |
| 38.44 | 2813 |
| 38.46 | 2878 |
| 38.48 | 2845 |
| 38.5 | 2757 |
| 38.52 | 2763 |
| 38.54 | 2755 |
| 38.56 | 2642 |
| 38.58 | 2622 |
| 38.6 | 2631 |
| 38.62 | 2701 |
| 38.64 | 2774 |
| 38.66 | 2703 |
| 38.68 | 2724 |
| 38.7 | 2718 |
| 38.72 | 2674 |
| 38.74 | 2622 |
| 38.76 | 2727 |
| 38.78 | 2588 |
| 38.8 | 2702 |
| 38.82 | 2632 |
| 38.84 | 2627 |
| 38.86 | 2627 |
| 38.88 | 2594 |
| 38.9 | 2580 |
| 38.92 | 2511 |
| 38.94 | 2580 |
| 38.96 | 2620 |
| 38.98 | 2534 |
| 39.0 | 2534 |
| 39.02 | 2488 |
| 39.04 | 2568 |
| 39.06 | 2510 |
| 39.08 | 2446 |
| 39.1 | 2489 |
| 39.12 | 2602 |
| 39.14 | 2518 |
| 39.16 | 2505 |
| 39.18 | 2456 |
| 39.2 | 2415 |
| 39.22 | 2463 |
| 39.24 | 2385 |
| 39.26 | 2370 |
| 39.28 | 2524 |
| 39.3 | 2464 |
| 39.32 | 2408 |
| 39.34 | 2428 |
| 39.36 | 2413 |
| 39.38 | 2378 |
| 39.4 | 2390 |
| 39.42 | 2403 |
| 39.44 | 2408 |
| 39.46 | 2347 |
| 39.48 | 2269 |
| 39.5 | 2304 |
| 39.52 | 2323 |
| 39.54 | 2343 |
| 39.56 | 2387 |
| 39.58 | 2238 |
| 39.6 | 2308 |
| 39.62 | 2357 |
| 39.64 | 2280 |
| 39.66 | 2262 |
| 39.68 | 2256 |
| 39.7 | 2257 |
| 39.72 | 2290 |
| 39.74 | 2163 |
| 39.76 | 2183 |
| 39.78 | 2143 |
| 39.8 | 2306 |
| 39.82 | 2262 |
| 39.84 | 2238 |
| 39.86 | 2259 |
| 39.88 | 2165 |
| 39.9 | 2127 |
| 39.92 | 2210 |
| 39.94 | 2138 |
| 39.96 | 2170 |
| 39.98 | 2221 |
| 40.0 | 2177 |
| 40.02 | 2217 |
| 40.04 | 2207 |
| 40.06 | 2128 |
| 40.08 | 2145 |
| 40.1 | 2167 |
| 40.12 | 2197 |
| 40.14 | 2066 |
| 40.16 | 2126 |
| 40.18 | 2197 |
| 40.2 | 2183 |
| 40.22 | 2129 |
| 40.24 | 2145 |
| 40.26 | 2174 |
| 40.28 | 2085 |
| 40.3 | 2066 |
| 40.32 | 2157 |
| 40.34 | 2092 |
| 40.36 | 2107 |
| 40.38 | 2064 |
| 40.4 | 2126 |
| 40.42 | 2068 |
| 40.44 | 2114 |
| 40.46 | 2029 |
| 40.48 | 2122 |
| 40.5 | 2047 |
| 40.52 | 2106 |
| 40.54 | 2026 |
| 40.56 | 2018 |
| 40.58 | 2016 |
| 40.6 | 1937 |
| 40.62 | 2031 |
| 40.64 | 2078 |
| 40.66 | 2007 |
| 40.68 | 2059 |
| 40.7 | 2069 |
| 40.72 | 2027 |
| 40.74 | 1929 |
| 40.76 | 2001 |
| 40.78 | 2013 |
| 40.8 | 2039 |
| 40.82 | 1952 |
| 40.84 | 1995 |
| 40.86 | 2027 |
| 40.88 | 2011 |
| 40.9 | 2032 |
| 40.92 | 1997 |
| 40.94 | 2035 |
| 40.96 | 2059 |
| 40.98 | 2120 |
| 41.0 | 1964 |
| 41.02 | 1993 |
| 41.04 | 1946 |
| 41.06 | 1990 |
| 41.08 | 1925 |
| 41.1 | 1944 |
| 41.12 | 1894 |
| 41.14 | 1944 |
| 41.16 | 2022 |
| 41.18 | 1949 |
| 41.2 | 1920 |
| 41.22 | 1942 |
| 41.24 | 1962 |
| 41.26 | 2001 |
| 41.28 | 1962 |
| 41.3 | 1949 |
| 41.32 | 1935 |
| 41.34 | 1947 |
| 41.36 | 1911 |
| 41.38 | 2010 |
| 41.4 | 1967 |
| 41.42 | 1937 |
| 41.44 | 1966 |
| 41.46 | 1856 |
| 41.48 | 1960 |
| 41.5 | 1955 |
| 41.52 | 1968 |
| 41.54 | 2037 |
| 41.56 | 1892 |
| 41.58 | 1942 |
| 41.6 | 2004 |
| 41.62 | 1985 |
| 41.64 | 1983 |
| 41.66 | 1931 |
| 41.68 | 1962 |
| 41.7 | 2024 |
| 41.72 | 1910 |
| 41.74 | 1993 |
| 41.76 | 1924 |
| 41.78 | 1890 |
| 41.8 | 1920 |
| 41.82 | 2017 |
| 41.84 | 1928 |
| 41.86 | 1956 |
| 41.88 | 2034 |
| 41.9 | 1968 |
| 41.92 | 1948 |
| 41.94 | 1968 |
| 41.96 | 1937 |
| 41.98 | 1953 |
| 42.0 | 1981 |
| 42.02 | 1965 |
| 42.04 | 1970 |
| 42.06 | 1953 |
| 42.08 | 1894 |
| 42.1 | 1936 |
| 42.12 | 2016 |
| 42.14 | 1951 |
| 42.16 | 1875 |
| 42.18 | 1933 |
| 42.2 | 1951 |
| 42.22 | 1961 |
| 42.24 | 1958 |
| 42.26 | 1931 |
| 42.28 | 1932 |
| 42.3 | 2064 |
| 42.32 | 1907 |
| 42.34 | 1930 |
| 42.36 | 1980 |
| 42.38 | 1947 |
| 42.4 | 1893 |
| 42.42 | 1941 |
| 42.44 | 2028 |
| 42.46 | 1957 |
| 42.48 | 1985 |
| 42.5 | 2009 |
| 42.52 | 1904 |
| 42.54 | 2017 |
| 42.56 | 1983 |
| 42.58 | 1968 |
| 42.6 | 1975 |
| 42.62 | 2016 |
| 42.64 | 1978 |
| 42.66 | 1901 |
| 42.68 | 1998 |
| 42.7 | 1976 |
| 42.72 | 1985 |
| 42.74 | 1981 |
| 42.76 | 1908 |
| 42.78 | 1974 |
| 42.8 | 1980 |
| 42.82 | 1960 |
| 42.84 | 1957 |
| 42.86 | 1976 |
| 42.88 | 2023 |
| 42.9 | 1992 |
| 42.92 | 1992 |
| 42.94 | 1948 |
| 42.96 | 1953 |
| 42.98 | 1950 |
| 43.0 | 2050 |
| 43.02 | 2012 |
| 43.04 | 2006 |
| 43.06 | 1954 |
| 43.08 | 2008 |
| 43.1 | 1984 |
| 43.12 | 1979 |
| 43.14 | 1927 |
| 43.16 | 1972 |
| 43.18 | 2026 |
| 43.2 | 2020 |
| 43.22 | 2042 |
| 43.24 | 2024 |
| 43.26 | 2032 |
| 43.28 | 2034 |
| 43.3 | 2004 |
| 43.32 | 2000 |
| 43.34 | 1968 |
| 43.36 | 1960 |
| 43.38 | 2074 |
| 43.4 | 2086 |
| 43.42 | 2118 |
| 43.44 | 1981 |
| 43.46 | 2032 |
| 43.48 | 1992 |
| 43.5 | 2049 |
| 43.52 | 2058 |
| 43.54 | 2042 |
| 43.56 | 1956 |
| 43.58 | 2073 |
| 43.6 | 2006 |
| 43.62 | 2110 |
| 43.64 | 2062 |
| 43.66 | 2120 |
| 43.68 | 2126 |
| 43.7 | 2084 |
| 43.72 | 2113 |
| 43.74 | 2094 |
| 43.76 | 1940 |
| 43.78 | 2080 |
| 43.8 | 2102 |
| 43.82 | 2005 |
| 43.84 | 2044 |
| 43.86 | 2073 |
| 43.88 | 2068 |
| 43.9 | 2083 |
| 43.92 | 2044 |
| 43.94 | 2095 |
| 43.96 | 2094 |
| 43.98 | 2047 |
| 44.0 | 2162 |
| 44.02 | 2098 |
| 44.04 | 2107 |
| 44.06 | 2116 |
| 44.08 | 2215 |
| 44.1 | 2077 |
| 44.12 | 2096 |
| 44.14 | 2114 |
| 44.16 | 2106 |
| 44.18 | 2111 |
| 44.2 | 2008 |
| 44.22 | 2168 |
| 44.24 | 2068 |
| 44.26 | 2105 |
| 44.28 | 2053 |
| 44.3 | 2125 |
| 44.32 | 2078 |
| 44.34 | 2121 |
| 44.36 | 2107 |
| 44.38 | 2100 |
| 44.4 | 2140 |
| 44.42 | 2115 |
| 44.44 | 2118 |
| 44.46 | 2079 |
| 44.48 | 2092 |
| 44.5 | 2059 |
| 44.52 | 2083 |
| 44.54 | 2146 |
| 44.56 | 2136 |
| 44.58 | 2088 |
| 44.6 | 2174 |
| 44.62 | 2289 |
| 44.64 | 2123 |
| 44.66 | 2189 |
| 44.68 | 2146 |
| 44.7 | 2093 |
| 44.72 | 2144 |
| 44.74 | 2117 |
| 44.76 | 2112 |
| 44.78 | 2263 |
| 44.8 | 2244 |
| 44.82 | 2092 |
| 44.84 | 2141 |
| 44.86 | 2157 |
| 44.88 | 2252 |
| 44.9 | 2176 |
| 44.92 | 2143 |
| 44.94 | 2184 |
| 44.96 | 2167 |
| 44.98 | 2168 |
| 45.0 | 2269 |
| 45.02 | 2265 |
| 45.04 | 2243 |
| 45.06 | 2228 |
| 45.08 | 2235 |
| 45.1 | 2222 |
| 45.12 | 2249 |
| 45.14 | 2176 |
| 45.16 | 2177 |
| 45.18 | 2256 |
| 45.2 | 2243 |
| 45.22 | 2284 |
| 45.24 | 2224 |
| 45.26 | 2265 |
| 45.28 | 2242 |
| 45.3 | 2296 |
| 45.32 | 2287 |
| 45.34 | 2284 |
| 45.36 | 2230 |
| 45.38 | 2314 |
| 45.4 | 2294 |
| 45.42 | 2274 |
| 45.44 | 2319 |
| 45.46 | 2267 |
| 45.48 | 2262 |
| 45.5 | 2118 |
| 45.52 | 2227 |
| 45.54 | 2297 |
| 45.56 | 2255 |
| 45.58 | 2220 |
| 45.6 | 2283 |
| 45.62 | 2270 |
| 45.64 | 2272 |
| 45.66 | 2332 |
| 45.68 | 2369 |
| 45.7 | 2323 |
| 45.72 | 2339 |
| 45.74 | 2312 |
| 45.76 | 2336 |
| 45.78 | 2335 |
| 45.8 | 2356 |
| 45.82 | 2478 |
| 45.84 | 2270 |
| 45.86 | 2266 |
| 45.88 | 2349 |
| 45.9 | 2332 |
| 45.92 | 2433 |
| 45.94 | 2404 |
| 45.96 | 2323 |
| 45.98 | 2400 |
| 46.0 | 2450 |
| 46.02 | 2334 |
| 46.04 | 2330 |
| 46.06 | 2327 |
| 46.08 | 2433 |
| 46.1 | 2445 |
| 46.12 | 2380 |
| 46.14 | 2380 |
| 46.16 | 2443 |
| 46.18 | 2388 |
| 46.2 | 2481 |
| 46.22 | 2415 |
| 46.24 | 2413 |
| 46.26 | 2398 |
| 46.28 | 2321 |
| 46.3 | 2419 |
| 46.32 | 2450 |
| 46.34 | 2426 |
| 46.36 | 2434 |
| 46.38 | 2430 |
| 46.4 | 2419 |
| 46.42 | 2391 |
| 46.44 | 2459 |
| 46.46 | 2329 |
| 46.48 | 2465 |
| 46.5 | 2477 |
| 46.52 | 2441 |
| 46.54 | 2398 |
| 46.56 | 2423 |
| 46.58 | 2409 |
| 46.6 | 2423 |
| 46.62 | 2445 |
| 46.64 | 2478 |
| 46.66 | 2534 |
| 46.68 | 2550 |
| 46.7 | 2516 |
| 46.72 | 2474 |
| 46.74 | 2532 |
| 46.76 | 2578 |
| 46.78 | 2607 |
| 46.8 | 2563 |
| 46.82 | 2566 |
| 46.84 | 2425 |
| 46.86 | 2564 |
| 46.88 | 2539 |
| 46.9 | 2501 |
| 46.92 | 2558 |
| 46.94 | 2521 |
| 46.96 | 2530 |
| 46.98 | 2439 |
| 47.0 | 2532 |
| 47.02 | 2527 |
| 47.04 | 2544 |
| 47.06 | 2523 |
| 47.08 | 2537 |
| 47.1 | 2542 |
| 47.12 | 2596 |
| 47.14 | 2602 |
| 47.16 | 2576 |
| 47.18 | 2562 |
| 47.2 | 2562 |
| 47.22 | 2532 |
| 47.24 | 2632 |
| 47.26 | 2639 |
| 47.28 | 2619 |
| 47.3 | 2524 |
| 47.32 | 2556 |
| 47.34 | 2612 |
| 47.36 | 2615 |
| 47.38 | 2619 |
| 47.4 | 2608 |
| 47.42 | 2642 |
| 47.44 | 2651 |
| 47.46 | 2589 |
| 47.48 | 2649 |
| 47.5 | 2640 |
| 47.52 | 2571 |
| 47.54 | 2607 |
| 47.56 | 2626 |
| 47.58 | 2666 |
| 47.6 | 2668 |
| 47.62 | 2657 |
| 47.64 | 2622 |
| 47.66 | 2671 |
| 47.68 | 2650 |
| 47.7 | 2594 |
| 47.72 | 2749 |
| 47.74 | 2746 |
| 47.76 | 2786 |
| 47.78 | 2611 |
| 47.8 | 2679 |
| 47.82 | 2686 |
| 47.84 | 2770 |
| 47.86 | 2714 |
| 47.88 | 2760 |
| 47.9 | 2676 |
| 47.92 | 2728 |
| 47.94 | 2711 |
| 47.96 | 2793 |
| 47.98 | 2603 |
| 48.0 | 2670 |
| 48.02 | 2735 |
| 48.04 | 2712 |
| 48.06 | 2698 |
| 48.08 | 2752 |
| 48.1 | 2689 |
| 48.12 | 2768 |
| 48.14 | 2779 |
| 48.16 | 2769 |
| 48.18 | 2770 |
| 48.2 | 2825 |
| 48.22 | 2698 |
| 48.24 | 2740 |
| 48.26 | 2747 |
| 48.28 | 2769 |
| 48.3 | 2730 |
| 48.32 | 2765 |
| 48.34 | 2803 |
| 48.36 | 2818 |
| 48.38 | 2735 |
| 48.4 | 2900 |
| 48.42 | 2735 |
| 48.44 | 2734 |
| 48.46 | 2672 |
| 48.48 | 2833 |
| 48.5 | 2805 |
| 48.52 | 2829 |
| 48.54 | 2820 |
| 48.56 | 2873 |
| 48.58 | 2902 |
| 48.6 | 2735 |
| 48.62 | 2866 |
| 48.64 | 2835 |
| 48.66 | 2885 |
| 48.68 | 2836 |
| 48.7 | 2858 |
| 48.72 | 2789 |
| 48.74 | 2859 |
| 48.76 | 2822 |
| 48.78 | 2907 |
| 48.8 | 2849 |
| 48.82 | 2821 |
| 48.84 | 2887 |
| 48.86 | 2838 |
| 48.88 | 2868 |
| 48.9 | 2902 |
| 48.92 | 2922 |
| 48.94 | 2928 |
| 48.96 | 2874 |
| 48.98 | 2892 |
| 49.0 | 2879 |
| 49.02 | 2896 |
| 49.04 | 2914 |
| 49.06 | 2890 |
| 49.08 | 2891 |
| 49.1 | 2881 |
| 49.12 | 2889 |
| 49.14 | 2956 |
| 49.16 | 2992 |
| 49.18 | 2938 |
| 49.2 | 2881 |
| 49.22 | 2872 |
| 49.24 | 2889 |
| 49.26 | 2961 |
| 49.28 | 2872 |
| 49.3 | 2922 |
| 49.32 | 2923 |
| 49.34 | 3098 |
| 49.36 | 2989 |
| 49.38 | 2924 |
| 49.4 | 2966 |
| 49.42 | 2982 |
| 49.44 | 3007 |
| 49.46 | 2976 |
| 49.48 | 3025 |
| 49.5 | 3020 |
| 49.52 | 3061 |
| 49.54 | 3054 |
| 49.56 | 3005 |
| 49.58 | 2977 |
| 49.6 | 2938 |
| 49.62 | 2828 |
| 49.64 | 2984 |
| 49.66 | 2980 |
| 49.68 | 2965 |
| 49.7 | 3041 |
| 49.72 | 2992 |
| 49.74 | 3011 |
| 49.76 | 2976 |
| 49.78 | 2970 |
| 49.8 | 3005 |
| 49.82 | 3039 |
| 49.84 | 2991 |
| 49.86 | 3061 |
| 49.88 | 2989 |
| 49.9 | 3037 |
| 49.92 | 2948 |
| 49.94 | 3073 |
| 49.96 | 2957 |
| 49.98 | 3070 |
| 50.0 | 3181 |
| 50.02 | 3117 |
| 50.04 | 2967 |
| 50.06 | 3128 |
| 50.08 | 2979 |
| 50.1 | 3182 |
| 50.12 | 3122 |
| 50.14 | 3080 |
| 50.16 | 3088 |
| 50.18 | 3084 |
| 50.2 | 2972 |
| 50.22 | 3049 |
| 50.24 | 3053 |
| 50.26 | 3118 |
| 50.28 | 3098 |
| 50.3 | 3151 |
| 50.32 | 3046 |
| 50.34 | 3111 |
| 50.36 | 3134 |
| 50.38 | 3135 |
| 50.4 | 3148 |
| 50.42 | 3059 |
| 50.44 | 3058 |
| 50.46 | 3105 |
| 50.48 | 3047 |
| 50.5 | 3075 |
| 50.52 | 3117 |
| 50.54 | 3205 |
| 50.56 | 3170 |
| 50.58 | 3197 |
| 50.6 | 3133 |
| 50.62 | 3145 |
| 50.64 | 3138 |
| 50.66 | 3146 |
| 50.68 | 3135 |
| 50.7 | 3148 |
| 50.72 | 3213 |
| 50.74 | 3157 |
| 50.76 | 3178 |
| 50.78 | 3135 |
| 50.8 | 3193 |
| 50.82 | 3094 |
| 50.84 | 3094 |
| 50.86 | 3125 |
| 50.88 | 3160 |
| 50.9 | 3242 |
| 50.92 | 3204 |
| 50.94 | 3225 |
| 50.96 | 3023 |
| 50.98 | 3147 |
| 51.0 | 3236 |
| 51.02 | 3237 |
| 51.04 | 3266 |
| 51.06 | 3288 |
| 51.08 | 3265 |
| 51.1 | 3227 |
| 51.12 | 3180 |
| 51.14 | 3135 |
| 51.16 | 3252 |
| 51.18 | 3105 |
| 51.2 | 3165 |
| 51.22 | 3271 |
| 51.24 | 3164 |
| 51.26 | 3246 |
| 51.28 | 3152 |
| 51.3 | 3264 |
| 51.32 | 3158 |
| 51.34 | 3144 |
| 51.36 | 3309 |
| 51.38 | 3123 |
| 51.4 | 3255 |
| 51.42 | 3280 |
| 51.44 | 3161 |
| 51.46 | 3243 |
| 51.48 | 3232 |
| 51.5 | 3309 |
| 51.52 | 3183 |
| 51.54 | 3288 |
| 51.56 | 3242 |
| 51.58 | 3304 |
| 51.6 | 3244 |
| 51.62 | 3202 |
| 51.64 | 3253 |
| 51.66 | 3291 |
| 51.68 | 3160 |
| 51.7 | 3242 |
| 51.72 | 3226 |
| 51.74 | 3286 |
| 51.76 | 3229 |
| 51.78 | 3278 |
| 51.8 | 3306 |
| 51.82 | 3343 |
| 51.84 | 3340 |
| 51.86 | 3372 |
| 51.88 | 3287 |
| 51.9 | 3310 |
| 51.92 | 3285 |
| 51.94 | 3338 |
| 51.96 | 3317 |
| 51.98 | 3319 |
| 52.0 | 3242 |
| 52.02 | 3262 |
| 52.04 | 3436 |
| 52.06 | 3284 |
| 52.08 | 3296 |
| 52.1 | 3305 |
| 52.12 | 3343 |
| 52.14 | 3256 |
| 52.16 | 3270 |
| 52.18 | 3329 |
| 52.2 | 3384 |
| 52.22 | 3311 |
| 52.24 | 3363 |
| 52.26 | 3303 |
| 52.28 | 3237 |
| 52.3 | 3228 |
| 52.32 | 3479 |
| 52.34 | 3356 |
| 52.36 | 3279 |
| 52.38 | 3227 |
| 52.4 | 3324 |
| 52.42 | 3329 |
| 52.44 | 3316 |
| 52.46 | 3337 |
| 52.48 | 3324 |
| 52.5 | 3390 |
| 52.52 | 3348 |
| 52.54 | 3357 |
| 52.56 | 3216 |
| 52.58 | 3371 |
| 52.6 | 3302 |
| 52.62 | 3369 |
| 52.64 | 3288 |
| 52.66 | 3398 |
| 52.68 | 3384 |
| 52.7 | 3331 |
| 52.72 | 3262 |
| 52.74 | 3346 |
| 52.76 | 3377 |
| 52.78 | 3324 |
| 52.8 | 3357 |
| 52.82 | 3335 |
| 52.84 | 3320 |
| 52.86 | 3361 |
| 52.88 | 3233 |
| 52.9 | 3342 |
| 52.92 | 3496 |
| 52.94 | 3337 |
| 52.96 | 3286 |
| 52.98 | 3348 |
| 53.0 | 3446 |
| 53.02 | 3288 |
| 53.04 | 3381 |
| 53.06 | 3348 |
| 53.08 | 3309 |
| 53.1 | 3280 |
| 53.12 | 3331 |
| 53.14 | 3451 |
| 53.16 | 3293 |
| 53.18 | 3335 |
| 53.2 | 3351 |
| 53.22 | 3399 |
| 53.24 | 3399 |
| 53.26 | 3440 |
| 53.28 | 3356 |
| 53.3 | 3445 |
| 53.32 | 3388 |
| 53.34 | 3390 |
| 53.36 | 3383 |
| 53.38 | 3355 |
| 53.4 | 3319 |
| 53.42 | 3325 |
| 53.44 | 3391 |
| 53.46 | 3400 |
| 53.48 | 3423 |
| 53.5 | 3397 |
| 53.52 | 3289 |
| 53.54 | 3392 |
| 53.56 | 3390 |
| 53.58 | 3315 |
| 53.6 | 3325 |
| 53.62 | 3382 |
| 53.64 | 3412 |
| 53.66 | 3303 |
| 53.68 | 3323 |
| 53.7 | 3357 |
| 53.72 | 3351 |
| 53.74 | 3435 |
| 53.76 | 3400 |
| 53.78 | 3289 |
| 53.8 | 3336 |
| 53.82 | 3298 |
| 53.84 | 3443 |
| 53.86 | 3336 |
| 53.88 | 3349 |
| 53.9 | 3357 |
| 53.92 | 3398 |
| 53.94 | 3343 |
| 53.96 | 3349 |
| 53.98 | 3464 |
| 54.0 | 3324 |
| 54.02 | 3308 |
| 54.04 | 3296 |
| 54.06 | 3326 |
| 54.08 | 3437 |
| 54.1 | 3487 |
| 54.12 | 3315 |
| 54.14 | 3468 |
| 54.16 | 3493 |
| 54.18 | 3344 |
| 54.2 | 3405 |
| 54.22 | 3326 |
| 54.24 | 3345 |
| 54.26 | 3344 |
| 54.28 | 3316 |
| 54.3 | 3385 |
| 54.32 | 3384 |
| 54.34 | 3369 |
| 54.36 | 3249 |
| 54.38 | 3300 |
| 54.4 | 3360 |
| 54.42 | 3300 |
| 54.44 | 3435 |
| 54.46 | 3408 |
| 54.48 | 3520 |
| 54.5 | 3294 |
| 54.52 | 3341 |
| 54.54 | 3431 |
| 54.56 | 3410 |
| 54.58 | 3372 |
| 54.6 | 3389 |
| 54.62 | 3278 |
| 54.64 | 3334 |
| 54.66 | 3310 |
| 54.68 | 3382 |
| 54.7 | 3409 |
| 54.72 | 3306 |
| 54.74 | 3359 |
| 54.76 | 3270 |
| 54.78 | 3378 |
| 54.8 | 3422 |
| 54.82 | 3291 |
| 54.84 | 3374 |
| 54.86 | 3378 |
| 54.88 | 3257 |
| 54.9 | 3294 |
| 54.92 | 3293 |
| 54.94 | 3268 |
| 54.96 | 3350 |
| 54.98 | 3361 |
| 55.0 | 3384 |
| 55.02 | 3355 |
| 55.04 | 3234 |
| 55.06 | 3383 |
| 55.08 | 3380 |
| 55.1 | 3356 |
| 55.12 | 3367 |
| 55.14 | 3290 |
| 55.16 | 3280 |
| 55.18 | 3303 |
| 55.2 | 3238 |
| 55.22 | 3372 |
| 55.24 | 3283 |
| 55.26 | 3363 |
| 55.28 | 3374 |
| 55.3 | 3271 |
| 55.32 | 3227 |
| 55.34 | 3313 |
| 55.36 | 3384 |
| 55.38 | 3334 |
| 55.4 | 3298 |
| 55.42 | 3383 |
| 55.44 | 3216 |
| 55.46 | 3297 |
| 55.48 | 3361 |
| 55.5 | 3305 |
| 55.52 | 3247 |
| 55.54 | 3331 |
| 55.56 | 3324 |
| 55.58 | 3243 |
| 55.6 | 3278 |
| 55.62 | 3267 |
| 55.64 | 3327 |
| 55.66 | 3300 |
| 55.68 | 3269 |
| 55.7 | 3262 |
| 55.72 | 3211 |
| 55.74 | 3211 |
| 55.76 | 3191 |
| 55.78 | 3261 |
| 55.8 | 3280 |
| 55.82 | 3196 |
| 55.84 | 3288 |
| 55.86 | 3393 |
| 55.88 | 3310 |
| 55.9 | 3293 |
| 55.92 | 3258 |
| 55.94 | 3311 |
| 55.96 | 3234 |
| 55.98 | 3263 |
| 56.0 | 3213 |
| 56.02 | 3266 |
| 56.04 | 3216 |
| 56.06 | 3164 |
| 56.08 | 3337 |
| 56.1 | 3240 |
| 56.12 | 3163 |
| 56.14 | 3163 |
| 56.16 | 3158 |
| 56.18 | 3309 |
| 56.2 | 3190 |
| 56.22 | 3182 |
| 56.24 | 3284 |
| 56.26 | 3249 |
| 56.28 | 3166 |
| 56.3 | 3288 |
| 56.32 | 3145 |
| 56.34 | 3244 |
| 56.36 | 3197 |
| 56.38 | 3198 |
| 56.4 | 3261 |
| 56.42 | 3271 |
| 56.44 | 3154 |
| 56.46 | 3223 |
| 56.48 | 3302 |
| 56.5 | 3148 |
| 56.52 | 3191 |
| 56.54 | 3192 |
| 56.56 | 3170 |
| 56.58 | 3217 |
| 56.6 | 3272 |
| 56.62 | 3204 |
| 56.64 | 3165 |
| 56.66 | 3166 |
| 56.68 | 3167 |
| 56.7 | 3166 |
| 56.72 | 3247 |
| 56.74 | 3078 |
| 56.76 | 3141 |
| 56.78 | 3161 |
| 56.8 | 3235 |
| 56.82 | 3169 |
| 56.84 | 3200 |
| 56.86 | 3109 |
| 56.88 | 3187 |
| 56.9 | 3088 |
| 56.92 | 3170 |
| 56.94 | 3132 |
| 56.96 | 3209 |
| 56.98 | 3263 |
| 57.0 | 3167 |
| 57.02 | 3133 |
| 57.04 | 3140 |
| 57.06 | 3160 |
| 57.08 | 3149 |
| 57.1 | 3181 |
| 57.12 | 3158 |
| 57.14 | 3196 |
| 57.16 | 3063 |
| 57.18 | 3139 |
| 57.2 | 3109 |
| 57.22 | 3140 |
| 57.24 | 3155 |
| 57.26 | 3213 |
| 57.28 | 3126 |
| 57.3 | 3194 |
| 57.32 | 3187 |
| 57.34 | 3106 |
| 57.36 | 3055 |
| 57.38 | 3041 |
| 57.4 | 3091 |
| 57.42 | 3088 |
| 57.44 | 3016 |
| 57.46 | 3054 |
| 57.48 | 2969 |
| 57.5 | 3170 |
| 57.52 | 3050 |
| 57.54 | 3054 |
| 57.56 | 3023 |
| 57.58 | 3180 |
| 57.6 | 3079 |
| 57.62 | 3107 |
| 57.64 | 3202 |
| 57.66 | 3174 |
| 57.68 | 3024 |
| 57.7 | 3159 |
| 57.72 | 3030 |
| 57.74 | 3044 |
| 57.76 | 3013 |
| 57.78 | 3145 |
| 57.8 | 2879 |
| 57.82 | 3103 |
| 57.84 | 3087 |
| 57.86 | 2998 |
| 57.88 | 3011 |
| 57.9 | 3056 |
| 57.92 | 2946 |
| 57.94 | 3015 |
| 57.96 | 3055 |
| 57.98 | 3029 |
| 58.0 | 3018 |
| 58.02 | 3043 |
| 58.04 | 3050 |
| 58.06 | 2967 |
| 58.08 | 2987 |
| 58.1 | 3003 |
| 58.12 | 2999 |
| 58.14 | 2993 |
| 58.16 | 2968 |
| 58.18 | 3057 |
| 58.2 | 2971 |
| 58.22 | 3007 |
| 58.24 | 2981 |
| 58.26 | 3014 |
| 58.28 | 2978 |
| 58.3 | 2965 |
| 58.32 | 3034 |
| 58.34 | 3009 |
| 58.36 | 3003 |
| 58.38 | 2924 |
| 58.4 | 2906 |
| 58.42 | 2852 |
| 58.44 | 2965 |
| 58.46 | 2895 |
| 58.48 | 2990 |
| 58.5 | 2954 |
| 58.52 | 2962 |
| 58.54 | 2958 |
| 58.56 | 2993 |
| 58.58 | 2957 |
| 58.6 | 2997 |
| 58.62 | 2992 |
| 58.64 | 2891 |
| 58.66 | 2938 |
| 58.68 | 2881 |
| 58.7 | 2976 |
| 58.72 | 2916 |
| 58.74 | 2901 |
| 58.76 | 2875 |
| 58.78 | 2892 |
| 58.8 | 2998 |
| 58.82 | 2959 |
| 58.84 | 2895 |
| 58.86 | 2858 |
| 58.88 | 2887 |
| 58.9 | 2882 |
| 58.92 | 2867 |
| 58.94 | 2870 |
| 58.96 | 2896 |
| 58.98 | 2832 |
| 59.0 | 2861 |
| 59.02 | 2914 |
| 59.04 | 2889 |
| 59.06 | 2930 |
| 59.08 | 2906 |
| 59.1 | 2888 |
| 59.12 | 2889 |
| 59.14 | 2857 |
| 59.16 | 2827 |
| 59.18 | 2864 |
| 59.2 | 2819 |
| 59.22 | 2870 |
| 59.24 | 2878 |
| 59.26 | 2781 |
| 59.28 | 2821 |
| 59.3 | 2849 |
| 59.32 | 2713 |
| 59.34 | 2889 |
| 59.36 | 2815 |
| 59.38 | 2812 |
| 59.4 | 2848 |
| 59.42 | 2805 |
| 59.44 | 2836 |
| 59.46 | 2808 |
| 59.48 | 2858 |
| 59.5 | 2902 |
| 59.52 | 2829 |
| 59.54 | 2820 |
| 59.56 | 2810 |
| 59.58 | 2728 |
| 59.6 | 2842 |
| 59.62 | 2731 |
| 59.64 | 2729 |
| 59.66 | 2721 |
| 59.68 | 2743 |
| 59.7 | 2813 |
| 59.72 | 2777 |
| 59.74 | 2819 |
| 59.76 | 2722 |
| 59.78 | 2691 |
| 59.8 | 2851 |
| 59.82 | 2820 |
| 59.84 | 2718 |
| 59.86 | 2733 |
| 59.88 | 2701 |
| 59.9 | 2723 |
| 59.92 | 2813 |
| 59.94 | 2650 |
| 59.96 | 2760 |
| 59.98 | 2745 |
| 60.0 | 2855 |
| 60.02 | 2758 |
| 60.04 | 2624 |
| 60.06 | 2727 |
| 60.08 | 2740 |
| 60.1 | 2734 |
| 60.12 | 2655 |
| 60.14 | 2710 |
| 60.16 | 2618 |
| 60.18 | 2651 |
| 60.2 | 2748 |
| 60.22 | 2728 |
| 60.24 | 2635 |
| 60.26 | 2778 |
| 60.28 | 2683 |
| 60.3 | 2671 |
| 60.32 | 2697 |
| 60.34 | 2760 |
| 60.36 | 2679 |
| 60.38 | 2731 |
| 60.4 | 2719 |
| 60.42 | 2656 |
| 60.44 | 2716 |
| 60.46 | 2624 |
| 60.48 | 2606 |
| 60.5 | 2710 |
| 60.52 | 2584 |
| 60.54 | 2660 |
| 60.56 | 2707 |
| 60.58 | 2640 |
| 60.6 | 2641 |
| 60.62 | 2661 |
| 60.64 | 2687 |
| 60.66 | 2638 |
| 60.68 | 2707 |
| 60.7 | 2683 |
| 60.72 | 2682 |
| 60.74 | 2604 |
| 60.76 | 2593 |
| 60.78 | 2576 |
| 60.8 | 2620 |
| 60.82 | 2580 |
| 60.84 | 2572 |
| 60.86 | 2607 |
| 60.88 | 2596 |
| 60.9 | 2663 |
| 60.92 | 2544 |
| 60.94 | 2504 |
| 60.96 | 2648 |
| 60.98 | 2537 |
| 61.0 | 2515 |
| 61.02 | 2488 |
| 61.04 | 2455 |
| 61.06 | 2589 |
| 61.08 | 2596 |
| 61.1 | 2526 |
| 61.12 | 2526 |
| 61.14 | 2504 |
| 61.16 | 2626 |
| 61.18 | 2607 |
| 61.2 | 2523 |
| 61.22 | 2505 |
| 61.24 | 2506 |
| 61.26 | 2544 |
| 61.28 | 2613 |
| 61.3 | 2579 |
| 61.32 | 2511 |
| 61.34 | 2583 |
| 61.36 | 2577 |
| 61.38 | 2531 |
| 61.4 | 2558 |
| 61.42 | 2530 |
| 61.44 | 2499 |
| 61.46 | 2582 |
| 61.48 | 2489 |
| 61.5 | 2478 |
| 61.52 | 2524 |
| 61.54 | 2444 |
| 61.56 | 2495 |
| 61.58 | 2552 |
| 61.6 | 2430 |
| 61.62 | 2482 |
| 61.64 | 2430 |
| 61.66 | 2449 |
| 61.68 | 2450 |
| 61.7 | 2487 |
| 61.72 | 2468 |
| 61.74 | 2445 |
| 61.76 | 2393 |
| 61.78 | 2428 |
| 61.8 | 2435 |
| 61.82 | 2387 |
| 61.84 | 2515 |
| 61.86 | 2424 |
| 61.88 | 2427 |
| 61.9 | 2473 |
| 61.92 | 2383 |
| 61.94 | 2384 |
| 61.96 | 2400 |
| 61.98 | 2502 |
| 62.0 | 2430 |
| 62.02 | 2485 |
| 62.04 | 2424 |
| 62.06 | 2406 |
| 62.08 | 2416 |
| 62.1 | 2318 |
| 62.12 | 2447 |
| 62.14 | 2427 |
| 62.16 | 2359 |
| 62.18 | 2407 |
| 62.2 | 2427 |
| 62.22 | 2418 |
| 62.24 | 2453 |
| 62.26 | 2411 |
| 62.28 | 2382 |
| 62.3 | 2390 |
| 62.32 | 2394 |
| 62.34 | 2387 |
| 62.36 | 2337 |
| 62.38 | 2355 |
| 62.4 | 2414 |
| 62.42 | 2373 |
| 62.44 | 2323 |
| 62.46 | 2394 |
| 62.48 | 2320 |
| 62.5 | 2306 |
| 62.52 | 2422 |
| 62.54 | 2330 |
| 62.56 | 2351 |
| 62.58 | 2335 |
| 62.6 | 2383 |
| 62.62 | 2384 |
| 62.64 | 2322 |
| 62.66 | 2342 |
| 62.68 | 2401 |
| 62.7 | 2382 |
| 62.72 | 2262 |
| 62.74 | 2389 |
| 62.76 | 2372 |
| 62.78 | 2393 |
| 62.8 | 2234 |
| 62.82 | 2321 |
| 62.84 | 2285 |
| 62.86 | 2319 |
| 62.88 | 2299 |
| 62.9 | 2252 |
| 62.92 | 2325 |
| 62.94 | 2261 |
| 62.96 | 2319 |
| 62.98 | 2253 |
| 63.0 | 2309 |
| 63.02 | 2333 |
| 63.04 | 2355 |
| 63.06 | 2256 |
| 63.08 | 2239 |
| 63.1 | 2271 |
| 63.12 | 2265 |
| 63.14 | 2235 |
| 63.16 | 2234 |
| 63.18 | 2334 |
| 63.2 | 2337 |
| 63.22 | 2239 |
| 63.24 | 2217 |
| 63.26 | 2227 |
| 63.28 | 2263 |
| 63.3 | 2234 |
| 63.32 | 2248 |
| 63.34 | 2235 |
| 63.36 | 2200 |
| 63.38 | 2329 |
| 63.4 | 2344 |
| 63.42 | 2263 |
| 63.44 | 2152 |
| 63.46 | 2212 |
| 63.48 | 2269 |
| 63.5 | 2215 |
| 63.52 | 2189 |
| 63.54 | 2253 |
| 63.56 | 2170 |
| 63.58 | 2194 |
| 63.6 | 2264 |
| 63.62 | 2240 |
| 63.64 | 2261 |
| 63.66 | 2166 |
| 63.68 | 2194 |
| 63.7 | 2155 |
| 63.72 | 2108 |
| 63.74 | 2211 |
| 63.76 | 2223 |
| 63.78 | 2182 |
| 63.8 | 2175 |
| 63.82 | 2214 |
| 63.84 | 2148 |
| 63.86 | 2217 |
| 63.88 | 2093 |
| 63.9 | 2139 |
| 63.92 | 2222 |
| 63.94 | 2178 |
| 63.96 | 2190 |
| 63.98 | 2129 |
| 64.0 | 2146 |
| 64.02 | 2191 |
| 64.04 | 2110 |
| 64.06 | 2149 |
| 64.08 | 2160 |
| 64.1 | 2180 |
| 64.12 | 2118 |
| 64.14 | 2082 |
| 64.16 | 2132 |
| 64.18 | 2165 |
| 64.2 | 2136 |
| 64.22 | 2185 |
| 64.24 | 2096 |
| 64.26 | 2124 |
| 64.28 | 2050 |
| 64.3 | 2103 |
| 64.32 | 2132 |
| 64.34 | 2137 |
| 64.36 | 2101 |
| 64.38 | 2082 |
| 64.4 | 2013 |
| 64.42 | 2060 |
| 64.44 | 2075 |
| 64.46 | 2119 |
| 64.48 | 2070 |
| 64.5 | 2141 |
| 64.52 | 2100 |
| 64.54 | 2084 |
| 64.56 | 2069 |
| 64.58 | 2014 |
| 64.6 | 2113 |
| 64.62 | 1989 |
| 64.64 | 2052 |
| 64.66 | 2064 |
| 64.68 | 2066 |
| 64.7 | 2055 |
| 64.72 | 2056 |
| 64.74 | 2036 |
| 64.76 | 2044 |
| 64.78 | 2050 |
| 64.8 | 2055 |
| 64.82 | 2017 |
| 64.84 | 2085 |
| 64.86 | 2020 |
| 64.88 | 2011 |
| 64.9 | 2059 |
| 64.92 | 2075 |
| 64.94 | 2066 |
| 64.96 | 2060 |
| 64.98 | 2051 |
| 65.0 | 2051 |
| 65.02 | 2030 |
| 65.04 | 1981 |
| 65.06 | 2035 |
| 65.08 | 1996 |
| 65.1 | 1993 |
| 65.12 | 2032 |
| 65.14 | 1937 |
| 65.16 | 1987 |
| 65.18 | 1950 |
| 65.2 | 1984 |
| 65.22 | 1980 |
| 65.24 | 1965 |
| 65.26 | 2030 |
| 65.28 | 1983 |
| 65.3 | 2072 |
| 65.32 | 1940 |
| 65.34 | 2050 |
| 65.36 | 2010 |
| 65.38 | 2049 |
| 65.4 | 1999 |
| 65.42 | 1931 |
| 65.44 | 1953 |
| 65.46 | 1917 |
| 65.48 | 1986 |
| 65.5 | 1931 |
| 65.52 | 1939 |
| 65.54 | 1921 |
| 65.56 | 2000 |
| 65.58 | 1942 |
| 65.6 | 1945 |
| 65.62 | 1924 |
| 65.64 | 1871 |
| 65.66 | 1970 |
| 65.68 | 1955 |
| 65.7 | 1934 |
| 65.72 | 1989 |
| 65.74 | 1960 |
| 65.76 | 1876 |
| 65.78 | 1919 |
| 65.8 | 1886 |
| 65.82 | 1920 |
| 65.84 | 1878 |
| 65.86 | 1979 |
| 65.88 | 1911 |
| 65.9 | 1984 |
| 65.92 | 1946 |
| 65.94 | 1888 |
| 65.96 | 1921 |
| 65.98 | 1828 |
| 66.0 | 1862 |
| 66.02 | 1881 |
| 66.04 | 1927 |
| 66.06 | 1877 |
| 66.08 | 1891 |
| 66.1 | 1940 |
| 66.12 | 1890 |
| 66.14 | 1883 |
| 66.16 | 1906 |
| 66.18 | 1836 |
| 66.2 | 1939 |
| 66.22 | 1901 |
| 66.24 | 1841 |
| 66.26 | 1869 |
| 66.28 | 1816 |
| 66.3 | 1813 |
| 66.32 | 1792 |
| 66.34 | 1809 |
| 66.36 | 1862 |
| 66.38 | 1822 |
| 66.4 | 1793 |
| 66.42 | 1848 |
| 66.44 | 1799 |
| 66.46 | 1842 |
| 66.48 | 1879 |
| 66.5 | 1796 |
| 66.52 | 1908 |
| 66.54 | 1832 |
| 66.56 | 1847 |
| 66.58 | 1830 |
| 66.6 | 1856 |
| 66.62 | 1757 |
| 66.64 | 1808 |
| 66.66 | 1820 |
| 66.68 | 1789 |
| 66.7 | 1790 |
| 66.72 | 1842 |
| 66.74 | 1854 |
| 66.76 | 1834 |
| 66.78 | 1878 |
| 66.8 | 1837 |
| 66.82 | 1849 |
| 66.84 | 1779 |
| 66.86 | 1791 |
| 66.88 | 1753 |
| 66.9 | 1793 |
| 66.92 | 1865 |
| 66.94 | 1832 |
| 66.96 | 1786 |
| 66.98 | 1793 |
| 67.0 | 1792 |
| 67.02 | 1829 |
| 67.04 | 1715 |
| 67.06 | 1775 |
| 67.08 | 1749 |
| 67.1 | 1857 |
| 67.12 | 1861 |
| 67.14 | 1780 |
| 67.16 | 1780 |
| 67.18 | 1783 |
| 67.2 | 1744 |
| 67.22 | 1749 |
| 67.24 | 1746 |
| 67.26 | 1827 |
| 67.28 | 1717 |
| 67.3 | 1742 |
| 67.32 | 1738 |
| 67.34 | 1714 |
| 67.36 | 1790 |
| 67.38 | 1734 |
| 67.4 | 1721 |
| 67.42 | 1723 |
| 67.44 | 1745 |
| 67.46 | 1823 |
| 67.48 | 1741 |
| 67.5 | 1745 |
| 67.52 | 1788 |
| 67.54 | 1683 |
| 67.56 | 1786 |
| 67.58 | 1721 |
| 67.6 | 1734 |
| 67.62 | 1745 |
| 67.64 | 1686 |
| 67.66 | 1796 |
| 67.68 | 1785 |
| 67.7 | 1670 |
| 67.72 | 1647 |
| 67.74 | 1734 |
| 67.76 | 1775 |
| 67.78 | 1728 |
| 67.8 | 1671 |
| 67.82 | 1669 |
| 67.84 | 1674 |
| 67.86 | 1722 |
| 67.88 | 1649 |
| 67.9 | 1655 |
| 67.92 | 1624 |
| 67.94 | 1697 |
| 67.96 | 1649 |
| 67.98 | 1703 |
| 68.0 | 1662 |
| 68.02 | 1723 |
| 68.04 | 1701 |
| 68.06 | 1654 |
| 68.08 | 1649 |
| 68.1 | 1733 |
| 68.12 | 1680 |
| 68.14 | 1711 |
| 68.16 | 1622 |
| 68.18 | 1600 |
| 68.2 | 1642 |
| 68.22 | 1623 |
| 68.24 | 1694 |
| 68.26 | 1694 |
| 68.28 | 1624 |
| 68.3 | 1679 |
| 68.32 | 1648 |
| 68.34 | 1653 |
| 68.36 | 1653 |
| 68.38 | 1649 |
| 68.4 | 1680 |
| 68.42 | 1602 |
| 68.44 | 1655 |
| 68.46 | 1633 |
| 68.48 | 1595 |
| 68.5 | 1628 |
| 68.52 | 1635 |
| 68.54 | 1615 |
| 68.56 | 1604 |
| 68.58 | 1690 |
| 68.6 | 1651 |
| 68.62 | 1696 |
| 68.64 | 1678 |
| 68.66 | 1626 |
| 68.68 | 1652 |
| 68.7 | 1632 |
| 68.72 | 1665 |
| 68.74 | 1635 |
| 68.76 | 1600 |
| 68.78 | 1669 |
| 68.8 | 1616 |
| 68.82 | 1563 |
| 68.84 | 1566 |
| 68.86 | 1578 |
| 68.88 | 1582 |
| 68.9 | 1605 |
| 68.92 | 1579 |
| 68.94 | 1648 |
| 68.96 | 1549 |
| 68.98 | 1584 |
| 69.0 | 1563 |
| 69.02 | 1622 |
| 69.04 | 1602 |
| 69.06 | 1533 |
| 69.08 | 1586 |
| 69.1 | 1628 |
| 69.12 | 1590 |
| 69.14 | 1511 |
| 69.16 | 1596 |
| 69.18 | 1643 |
| 69.2 | 1607 |
| 69.22 | 1615 |
| 69.24 | 1612 |
| 69.26 | 1536 |
| 69.28 | 1494 |
| 69.3 | 1569 |
| 69.32 | 1570 |
| 69.34 | 1625 |
| 69.36 | 1570 |
| 69.38 | 1580 |
| 69.4 | 1506 |
| 69.42 | 1586 |
| 69.44 | 1596 |
| 69.46 | 1566 |
| 69.48 | 1593 |
| 69.5 | 1538 |
| 69.52 | 1611 |
| 69.54 | 1569 |
| 69.56 | 1465 |
| 69.58 | 1574 |
| 69.6 | 1584 |
| 69.62 | 1581 |
| 69.64 | 1514 |
| 69.66 | 1479 |
| 69.68 | 1624 |
| 69.7 | 1554 |
| 69.72 | 1575 |
| 69.74 | 1548 |
| 69.76 | 1552 |
| 69.78 | 1547 |
| 69.8 | 1571 |
| 69.82 | 1567 |
| 69.84 | 1479 |
| 69.86 | 1514 |
| 69.88 | 1550 |
| 69.9 | 1421 |
| 69.92 | 1529 |
| 69.94 | 1520 |
| 69.96 | 1569 |
| 69.98 | 1556 |
| 70.0 | 1538 |
| 70.02 | 1492 |
| 70.04 | 1586 |
| 70.06 | 1501 |
| 70.08 | 1586 |
| 70.1 | 1540 |
| 70.12 | 1541 |
| 70.14 | 1504 |
| 70.16 | 1501 |
| 70.18 | 1542 |
| 70.2 | 1530 |
| 70.22 | 1528 |
| 70.24 | 1499 |
| 70.26 | 1507 |
| 70.28 | 1459 |
| 70.3 | 1477 |
| 70.32 | 1531 |
| 70.34 | 1478 |
| 70.36 | 1530 |
| 70.38 | 1508 |
| 70.4 | 1436 |
| 70.42 | 1516 |
| 70.44 | 1450 |
| 70.46 | 1548 |
| 70.48 | 1495 |
| 70.5 | 1467 |
| 70.52 | 1455 |
| 70.54 | 1541 |
| 70.56 | 1531 |
| 70.58 | 1495 |
| 70.6 | 1475 |
| 70.62 | 1450 |
| 70.64 | 1427 |
| 70.66 | 1438 |
| 70.68 | 1483 |
| 70.7 | 1447 |
| 70.72 | 1459 |
| 70.74 | 1469 |
| 70.76 | 1582 |
| 70.78 | 1427 |
| 70.8 | 1434 |
| 70.82 | 1405 |
| 70.84 | 1435 |
| 70.86 | 1545 |
| 70.88 | 1469 |
| 70.9 | 1530 |
| 70.92 | 1476 |
| 70.94 | 1482 |
| 70.96 | 1484 |
| 70.98 | 1501 |
| 71.0 | 1492 |
| 71.02 | 1387 |
| 71.04 | 1428 |
| 71.06 | 1396 |
| 71.08 | 1480 |
| 71.1 | 1453 |
| 71.12 | 1425 |
| 71.14 | 1506 |
| 71.16 | 1474 |
| 71.18 | 1469 |
| 71.2 | 1453 |
| 71.22 | 1497 |
| 71.24 | 1469 |
| 71.26 | 1495 |
| 71.28 | 1435 |
| 71.3 | 1473 |
| 71.32 | 1422 |
| 71.34 | 1456 |
| 71.36 | 1491 |
| 71.38 | 1457 |
| 71.4 | 1402 |
| 71.42 | 1447 |
| 71.44 | 1469 |
| 71.46 | 1422 |
| 71.48 | 1416 |
| 71.5 | 1467 |
| 71.52 | 1454 |
| 71.54 | 1369 |
| 71.56 | 1417 |
| 71.58 | 1454 |
| 71.6 | 1425 |
| 71.62 | 1423 |
| 71.64 | 1526 |
| 71.66 | 1432 |
| 71.68 | 1449 |
| 71.7 | 1438 |
| 71.72 | 1414 |
| 71.74 | 1465 |
| 71.76 | 1439 |
| 71.78 | 1444 |
| 71.8 | 1474 |
| 71.82 | 1425 |
| 71.84 | 1497 |
| 71.86 | 1413 |
| 71.88 | 1473 |
| 71.9 | 1413 |
| 71.92 | 1412 |
| 71.94 | 1446 |
| 71.96 | 1392 |
| 71.98 | 1426 |
| 72.0 | 1465 |
| 72.02 | 1512 |
| 72.04 | 1493 |
| 72.06 | 1403 |
| 72.08 | 1376 |
| 72.1 | 1441 |
| 72.12 | 1368 |
| 72.14 | 1433 |
| 72.16 | 1447 |
| 72.18 | 1437 |
| 72.2 | 1395 |
| 72.22 | 1422 |
| 72.24 | 1401 |
| 72.26 | 1410 |
| 72.28 | 1346 |
| 72.3 | 1428 |
| 72.32 | 1403 |
| 72.34 | 1426 |
| 72.36 | 1373 |
| 72.38 | 1389 |
| 72.4 | 1451 |
| 72.42 | 1412 |
| 72.44 | 1390 |
| 72.46 | 1425 |
| 72.48 | 1413 |
| 72.5 | 1403 |
| 72.52 | 1369 |
| 72.54 | 1374 |
| 72.56 | 1437 |
| 72.58 | 1394 |
| 72.6 | 1368 |
| 72.62 | 1402 |
| 72.64 | 1389 |
| 72.66 | 1423 |
| 72.68 | 1434 |
| 72.7 | 1400 |
| 72.72 | 1292 |
| 72.74 | 1406 |
| 72.76 | 1331 |
| 72.78 | 1404 |
| 72.8 | 1393 |
| 72.82 | 1368 |
| 72.84 | 1412 |
| 72.86 | 1394 |
| 72.88 | 1388 |
| 72.9 | 1404 |
| 72.92 | 1382 |
| 72.94 | 1432 |
| 72.96 | 1419 |
| 72.98 | 1384 |
| 73.0 | 1336 |
| 73.02 | 1393 |
| 73.04 | 1425 |
| 73.06 | 1386 |
| 73.08 | 1405 |
| 73.1 | 1406 |
| 73.12 | 1316 |
| 73.14 | 1391 |
| 73.16 | 1388 |
| 73.18 | 1404 |
| 73.2 | 1337 |
| 73.22 | 1376 |
| 73.24 | 1400 |
| 73.26 | 1398 |
| 73.28 | 1414 |
| 73.3 | 1395 |
| 73.32 | 1314 |
| 73.34 | 1392 |
| 73.36 | 1330 |
| 73.38 | 1308 |
| 73.4 | 1371 |
| 73.42 | 1357 |
| 73.44 | 1389 |
| 73.46 | 1366 |
| 73.48 | 1375 |
| 73.5 | 1449 |
| 73.52 | 1444 |
| 73.54 | 1371 |
| 73.56 | 1501 |
| 73.58 | 1465 |
| 73.6 | 1386 |
| 73.62 | 1407 |
| 73.64 | 1385 |
| 73.66 | 1432 |
| 73.68 | 1349 |
| 73.7 | 1414 |
| 73.72 | 1331 |
| 73.74 | 1414 |
| 73.76 | 1434 |
| 73.78 | 1385 |
| 73.8 | 1390 |
| 73.82 | 1389 |
| 73.84 | 1301 |
| 73.86 | 1415 |
| 73.88 | 1360 |
| 73.9 | 1383 |
| 73.92 | 1359 |
| 73.94 | 1420 |
| 73.96 | 1359 |
| 73.98 | 1379 |
| 74.0 | 1394 |
| 74.02 | 1420 |
| 74.04 | 1390 |
| 74.06 | 1395 |
| 74.08 | 1371 |
| 74.1 | 1334 |
| 74.12 | 1405 |
| 74.14 | 1409 |
| 74.16 | 1441 |
| 74.18 | 1379 |
| 74.2 | 1402 |
| 74.22 | 1350 |
| 74.24 | 1298 |
| 74.26 | 1403 |
| 74.28 | 1373 |
| 74.3 | 1355 |
| 74.32 | 1331 |
| 74.34 | 1339 |
| 74.36 | 1376 |
| 74.38 | 1468 |
| 74.4 | 1415 |
| 74.42 | 1382 |
| 74.44 | 1336 |
| 74.46 | 1425 |
| 74.48 | 1393 |
| 74.5 | 1371 |
| 74.52 | 1412 |
| 74.54 | 1343 |
| 74.56 | 1384 |
| 74.58 | 1327 |
| 74.6 | 1399 |
| 74.62 | 1421 |
| 74.64 | 1451 |
| 74.66 | 1363 |
| 74.68 | 1338 |
| 74.7 | 1395 |
| 74.72 | 1362 |
| 74.74 | 1397 |
| 74.76 | 1368 |
| 74.78 | 1410 |
| 74.8 | 1397 |
| 74.82 | 1413 |
| 74.84 | 1450 |
| 74.86 | 1411 |
| 74.88 | 1364 |
| 74.9 | 1438 |
| 74.92 | 1327 |
| 74.94 | 1416 |
| 74.96 | 1432 |
| 74.98 | 1428 |
| 75.0 | 1410 |
| 75.02 | 1368 |
| 75.04 | 1372 |
| 75.06 | 1402 |
| 75.08 | 1407 |
| 75.1 | 1360 |
| 75.12 | 1359 |
| 75.14 | 1329 |
| 75.16 | 1344 |
| 75.18 | 1332 |
| 75.2 | 1367 |
| 75.22 | 1437 |
| 75.24 | 1386 |
| 75.26 | 1319 |
| 75.28 | 1407 |
| 75.3 | 1385 |
| 75.32 | 1350 |
| 75.34 | 1414 |
| 75.36 | 1326 |
| 75.38 | 1383 |
| 75.4 | 1430 |
| 75.42 | 1344 |
| 75.44 | 1360 |
| 75.46 | 1366 |
| 75.48 | 1415 |
| 75.5 | 1340 |
| 75.52 | 1416 |
| 75.54 | 1378 |
| 75.56 | 1340 |
| 75.58 | 1391 |
| 75.6 | 1398 |
| 75.62 | 1425 |
| 75.64 | 1371 |
| 75.66 | 1404 |
| 75.68 | 1372 |
| 75.7 | 1344 |
| 75.72 | 1511 |
| 75.74 | 1349 |
| 75.76 | 1403 |
| 75.78 | 1369 |
| 75.8 | 1366 |
| 75.82 | 1428 |
| 75.84 | 1412 |
| 75.86 | 1438 |
| 75.88 | 1375 |
| 75.9 | 1391 |
| 75.92 | 1450 |
| 75.94 | 1394 |
| 75.96 | 1406 |
| 75.98 | 1463 |
| 76.0 | 1313 |
| 76.02 | 1419 |
| 76.04 | 1420 |
| 76.06 | 1333 |
| 76.08 | 1427 |
| 76.1 | 1399 |
| 76.12 | 1435 |
| 76.14 | 1377 |
| 76.16 | 1379 |
| 76.18 | 1468 |
| 76.2 | 1387 |
| 76.22 | 1371 |
| 76.24 | 1432 |
| 76.26 | 1359 |
| 76.28 | 1419 |
| 76.3 | 1427 |
| 76.32 | 1453 |
| 76.34 | 1363 |
| 76.36 | 1418 |
| 76.38 | 1396 |
| 76.4 | 1440 |
| 76.42 | 1400 |
| 76.44 | 1423 |
| 76.46 | 1399 |
| 76.48 | 1462 |
| 76.5 | 1418 |
| 76.52 | 1476 |
| 76.54 | 1421 |
| 76.56 | 1456 |
| 76.58 | 1390 |
| 76.6 | 1394 |
| 76.62 | 1438 |
| 76.64 | 1422 |
| 76.66 | 1432 |
| 76.68 | 1432 |
| 76.7 | 1465 |
| 76.72 | 1385 |
| 76.74 | 1384 |
| 76.76 | 1364 |
| 76.78 | 1367 |
| 76.8 | 1382 |
| 76.82 | 1435 |
| 76.84 | 1427 |
| 76.86 | 1390 |
| 76.88 | 1375 |
| 76.9 | 1390 |
| 76.92 | 1431 |
| 76.94 | 1427 |
| 76.96 | 1429 |
| 76.98 | 1419 |
| 77.0 | 1478 |
| 77.02 | 1425 |
| 77.04 | 1414 |
| 77.06 | 1448 |
| 77.08 | 1408 |
| 77.1 | 1461 |
| 77.12 | 1419 |
| 77.14 | 1384 |
| 77.16 | 1439 |
| 77.18 | 1393 |
| 77.2 | 1434 |
| 77.22 | 1419 |
| 77.24 | 1446 |
| 77.26 | 1388 |
| 77.28 | 1421 |
| 77.3 | 1400 |
| 77.32 | 1498 |
| 77.34 | 1473 |
| 77.36 | 1393 |
| 77.38 | 1446 |
| 77.4 | 1453 |
| 77.42 | 1457 |
| 77.44 | 1435 |
| 77.46 | 1416 |
| 77.48 | 1466 |
| 77.5 | 1363 |
| 77.52 | 1413 |
| 77.54 | 1452 |
| 77.56 | 1434 |
| 77.58 | 1432 |
| 77.6 | 1479 |
| 77.62 | 1475 |
| 77.64 | 1456 |
| 77.66 | 1453 |
| 77.68 | 1464 |
| 77.7 | 1438 |
| 77.72 | 1468 |
| 77.74 | 1447 |
| 77.76 | 1475 |
| 77.78 | 1426 |
| 77.8 | 1387 |
| 77.82 | 1423 |
| 77.84 | 1385 |
| 77.86 | 1371 |
| 77.88 | 1455 |
| 77.9 | 1409 |
| 77.92 | 1503 |
| 77.94 | 1432 |
| 77.96 | 1467 |
| 77.98 | 1407 |
| 78.0 | 1460 |
| 78.02 | 1410 |
| 78.04 | 1453 |
| 78.06 | 1486 |
| 78.08 | 1507 |
| 78.1 | 1442 |
| 78.12 | 1419 |
| 78.14 | 1425 |
| 78.16 | 1458 |
| 78.18 | 1470 |
| 78.2 | 1493 |
| 78.22 | 1424 |
| 78.24 | 1403 |
| 78.26 | 1468 |
| 78.28 | 1573 |
| 78.3 | 1461 |
| 78.32 | 1468 |
| 78.34 | 1450 |
| 78.36 | 1381 |
| 78.38 | 1393 |
| 78.4 | 1414 |
| 78.42 | 1383 |
| 78.44 | 1509 |
| 78.46 | 1461 |
| 78.48 | 1474 |
| 78.5 | 1530 |
| 78.52 | 1400 |
| 78.54 | 1429 |
| 78.56 | 1403 |
| 78.58 | 1419 |
| 78.6 | 1441 |
| 78.62 | 1481 |
| 78.64 | 1516 |
| 78.66 | 1504 |
| 78.68 | 1457 |
| 78.7 | 1396 |
| 78.72 | 1495 |
| 78.74 | 1462 |
| 78.76 | 1464 |
| 78.78 | 1466 |
| 78.8 | 1426 |
| 78.82 | 1488 |
| 78.84 | 1419 |
| 78.86 | 1529 |
| 78.88 | 1446 |
| 78.9 | 1480 |
| 78.92 | 1447 |
| 78.94 | 1499 |
| 78.96 | 1401 |
| 78.98 | 1472 |
| 79.0 | 1479 |
| 79.02 | 1426 |
| 79.04 | 1471 |
| 79.06 | 1498 |
| 79.08 | 1469 |
| 79.1 | 1475 |
| 79.12 | 1508 |
| 79.14 | 1420 |
| 79.16 | 1440 |
| 79.18 | 1522 |
| 79.2 | 1491 |
| 79.22 | 1476 |
| 79.24 | 1494 |
| 79.26 | 1514 |
| 79.28 | 1461 |
| 79.3 | 1468 |
| 79.32 | 1475 |
| 79.34 | 1454 |
| 79.36 | 1569 |
| 79.38 | 1447 |
| 79.4 | 1474 |
| 79.42 | 1424 |
| 79.44 | 1495 |
| 79.46 | 1472 |
| 79.48 | 1477 |
| 79.5 | 1492 |
| 79.52 | 1413 |
| 79.54 | 1443 |
| 79.56 | 1453 |
| 79.58 | 1472 |
| 79.6 | 1485 |
| 79.62 | 1436 |
| 79.64 | 1411 |
| 79.66 | 1411 |
| 79.68 | 1453 |
| 79.7 | 1462 |
| 79.72 | 1517 |
| 79.74 | 1461 |
| 79.76 | 1419 |
| 79.78 | 1512 |
| 79.8 | 1431 |
| 79.82 | 1444 |
| 79.84 | 1388 |
| 79.86 | 1457 |
| 79.88 | 1454 |
| 79.9 | 1468 |
| 79.92 | 1429 |
| 79.94 | 1496 |
| 79.96 | 1473 |
| 79.98 | 1470 |
| 80.0 | 1485 |